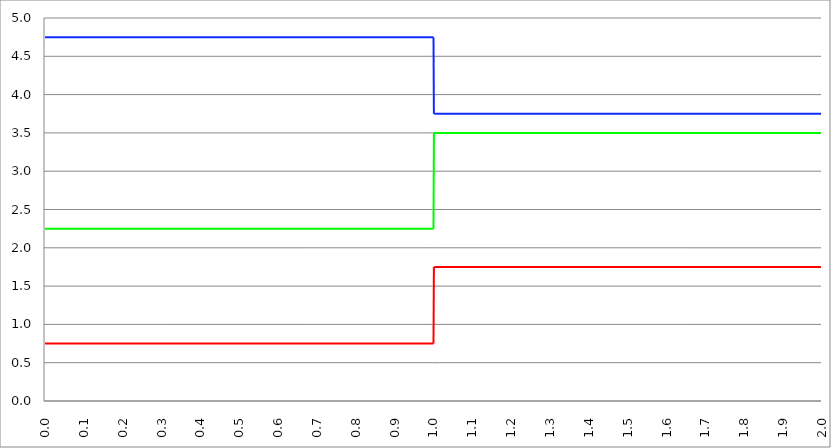
| Category | Series 1 | Series 0 | Series 2 |
|---|---|---|---|
| 0.0 | 0.75 | 2.25 | 4.75 |
| 0.001 | 0.75 | 2.25 | 4.75 |
| 0.002 | 0.75 | 2.25 | 4.75 |
| 0.003 | 0.75 | 2.25 | 4.75 |
| 0.004 | 0.75 | 2.25 | 4.75 |
| 0.005 | 0.75 | 2.25 | 4.75 |
| 0.006 | 0.75 | 2.25 | 4.75 |
| 0.007 | 0.75 | 2.25 | 4.75 |
| 0.008 | 0.75 | 2.25 | 4.75 |
| 0.009 | 0.75 | 2.25 | 4.75 |
| 0.01 | 0.75 | 2.25 | 4.75 |
| 0.011 | 0.75 | 2.25 | 4.75 |
| 0.012 | 0.75 | 2.25 | 4.75 |
| 0.013 | 0.75 | 2.25 | 4.75 |
| 0.014 | 0.75 | 2.25 | 4.75 |
| 0.015 | 0.75 | 2.25 | 4.75 |
| 0.016 | 0.75 | 2.25 | 4.75 |
| 0.017 | 0.75 | 2.25 | 4.75 |
| 0.018 | 0.75 | 2.25 | 4.75 |
| 0.019 | 0.75 | 2.25 | 4.75 |
| 0.02 | 0.75 | 2.25 | 4.75 |
| 0.021 | 0.75 | 2.25 | 4.75 |
| 0.022 | 0.75 | 2.25 | 4.75 |
| 0.023 | 0.75 | 2.25 | 4.75 |
| 0.024 | 0.75 | 2.25 | 4.75 |
| 0.025 | 0.75 | 2.25 | 4.75 |
| 0.026 | 0.75 | 2.25 | 4.75 |
| 0.027 | 0.75 | 2.25 | 4.75 |
| 0.028 | 0.75 | 2.25 | 4.75 |
| 0.029 | 0.75 | 2.25 | 4.75 |
| 0.03 | 0.75 | 2.25 | 4.75 |
| 0.031 | 0.75 | 2.25 | 4.75 |
| 0.032 | 0.75 | 2.25 | 4.75 |
| 0.033 | 0.75 | 2.25 | 4.75 |
| 0.034 | 0.75 | 2.25 | 4.75 |
| 0.035 | 0.75 | 2.25 | 4.75 |
| 0.036 | 0.75 | 2.25 | 4.75 |
| 0.037 | 0.75 | 2.25 | 4.75 |
| 0.038 | 0.75 | 2.25 | 4.75 |
| 0.039 | 0.75 | 2.25 | 4.75 |
| 0.04 | 0.75 | 2.25 | 4.75 |
| 0.041 | 0.75 | 2.25 | 4.75 |
| 0.042 | 0.75 | 2.25 | 4.75 |
| 0.043 | 0.75 | 2.25 | 4.75 |
| 0.044 | 0.75 | 2.25 | 4.75 |
| 0.045 | 0.75 | 2.25 | 4.75 |
| 0.046 | 0.75 | 2.25 | 4.75 |
| 0.047 | 0.75 | 2.25 | 4.75 |
| 0.048 | 0.75 | 2.25 | 4.75 |
| 0.049 | 0.75 | 2.25 | 4.75 |
| 0.05 | 0.75 | 2.25 | 4.75 |
| 0.051 | 0.75 | 2.25 | 4.75 |
| 0.052 | 0.75 | 2.25 | 4.75 |
| 0.053 | 0.75 | 2.25 | 4.75 |
| 0.054 | 0.75 | 2.25 | 4.75 |
| 0.055 | 0.75 | 2.25 | 4.75 |
| 0.056 | 0.75 | 2.25 | 4.75 |
| 0.057 | 0.75 | 2.25 | 4.75 |
| 0.058 | 0.75 | 2.25 | 4.75 |
| 0.059 | 0.75 | 2.25 | 4.75 |
| 0.06 | 0.75 | 2.25 | 4.75 |
| 0.061 | 0.75 | 2.25 | 4.75 |
| 0.062 | 0.75 | 2.25 | 4.75 |
| 0.063 | 0.75 | 2.25 | 4.75 |
| 0.064 | 0.75 | 2.25 | 4.75 |
| 0.065 | 0.75 | 2.25 | 4.75 |
| 0.066 | 0.75 | 2.25 | 4.75 |
| 0.067 | 0.75 | 2.25 | 4.75 |
| 0.068 | 0.75 | 2.25 | 4.75 |
| 0.069 | 0.75 | 2.25 | 4.75 |
| 0.07 | 0.75 | 2.25 | 4.75 |
| 0.071 | 0.75 | 2.25 | 4.75 |
| 0.072 | 0.75 | 2.25 | 4.75 |
| 0.073 | 0.75 | 2.25 | 4.75 |
| 0.074 | 0.75 | 2.25 | 4.75 |
| 0.075 | 0.75 | 2.25 | 4.75 |
| 0.076 | 0.75 | 2.25 | 4.75 |
| 0.077 | 0.75 | 2.25 | 4.75 |
| 0.078 | 0.75 | 2.25 | 4.75 |
| 0.079 | 0.75 | 2.25 | 4.75 |
| 0.08 | 0.75 | 2.25 | 4.75 |
| 0.081 | 0.75 | 2.25 | 4.75 |
| 0.082 | 0.75 | 2.25 | 4.75 |
| 0.083 | 0.75 | 2.25 | 4.75 |
| 0.084 | 0.75 | 2.25 | 4.75 |
| 0.085 | 0.75 | 2.25 | 4.75 |
| 0.086 | 0.75 | 2.25 | 4.75 |
| 0.087 | 0.75 | 2.25 | 4.75 |
| 0.088 | 0.75 | 2.25 | 4.75 |
| 0.089 | 0.75 | 2.25 | 4.75 |
| 0.09 | 0.75 | 2.25 | 4.75 |
| 0.091 | 0.75 | 2.25 | 4.75 |
| 0.092 | 0.75 | 2.25 | 4.75 |
| 0.093 | 0.75 | 2.25 | 4.75 |
| 0.094 | 0.75 | 2.25 | 4.75 |
| 0.095 | 0.75 | 2.25 | 4.75 |
| 0.096 | 0.75 | 2.25 | 4.75 |
| 0.097 | 0.75 | 2.25 | 4.75 |
| 0.098 | 0.75 | 2.25 | 4.75 |
| 0.099 | 0.75 | 2.25 | 4.75 |
| 0.1 | 0.75 | 2.25 | 4.75 |
| 0.101 | 0.75 | 2.25 | 4.75 |
| 0.102 | 0.75 | 2.25 | 4.75 |
| 0.103 | 0.75 | 2.25 | 4.75 |
| 0.104 | 0.75 | 2.25 | 4.75 |
| 0.105 | 0.75 | 2.25 | 4.75 |
| 0.106 | 0.75 | 2.25 | 4.75 |
| 0.107 | 0.75 | 2.25 | 4.75 |
| 0.108 | 0.75 | 2.25 | 4.75 |
| 0.109 | 0.75 | 2.25 | 4.75 |
| 0.11 | 0.75 | 2.25 | 4.75 |
| 0.111 | 0.75 | 2.25 | 4.75 |
| 0.112 | 0.75 | 2.25 | 4.75 |
| 0.113 | 0.75 | 2.25 | 4.75 |
| 0.114 | 0.75 | 2.25 | 4.75 |
| 0.115 | 0.75 | 2.25 | 4.75 |
| 0.116 | 0.75 | 2.25 | 4.75 |
| 0.117 | 0.75 | 2.25 | 4.75 |
| 0.118 | 0.75 | 2.25 | 4.75 |
| 0.119 | 0.75 | 2.25 | 4.75 |
| 0.12 | 0.75 | 2.25 | 4.75 |
| 0.121 | 0.75 | 2.25 | 4.75 |
| 0.122 | 0.75 | 2.25 | 4.75 |
| 0.123 | 0.75 | 2.25 | 4.75 |
| 0.124 | 0.75 | 2.25 | 4.75 |
| 0.125 | 0.75 | 2.25 | 4.75 |
| 0.126 | 0.75 | 2.25 | 4.75 |
| 0.127 | 0.75 | 2.25 | 4.75 |
| 0.128 | 0.75 | 2.25 | 4.75 |
| 0.129 | 0.75 | 2.25 | 4.75 |
| 0.13 | 0.75 | 2.25 | 4.75 |
| 0.131 | 0.75 | 2.25 | 4.75 |
| 0.132 | 0.75 | 2.25 | 4.75 |
| 0.133 | 0.75 | 2.25 | 4.75 |
| 0.134 | 0.75 | 2.25 | 4.75 |
| 0.135 | 0.75 | 2.25 | 4.75 |
| 0.136 | 0.75 | 2.25 | 4.75 |
| 0.137 | 0.75 | 2.25 | 4.75 |
| 0.138 | 0.75 | 2.25 | 4.75 |
| 0.139 | 0.75 | 2.25 | 4.75 |
| 0.14 | 0.75 | 2.25 | 4.75 |
| 0.141 | 0.75 | 2.25 | 4.75 |
| 0.142 | 0.75 | 2.25 | 4.75 |
| 0.143 | 0.75 | 2.25 | 4.75 |
| 0.144 | 0.75 | 2.25 | 4.75 |
| 0.145 | 0.75 | 2.25 | 4.75 |
| 0.146 | 0.75 | 2.25 | 4.75 |
| 0.147 | 0.75 | 2.25 | 4.75 |
| 0.148 | 0.75 | 2.25 | 4.75 |
| 0.149 | 0.75 | 2.25 | 4.75 |
| 0.15 | 0.75 | 2.25 | 4.75 |
| 0.151 | 0.75 | 2.25 | 4.75 |
| 0.152 | 0.75 | 2.25 | 4.75 |
| 0.153 | 0.75 | 2.25 | 4.75 |
| 0.154 | 0.75 | 2.25 | 4.75 |
| 0.155 | 0.75 | 2.25 | 4.75 |
| 0.156 | 0.75 | 2.25 | 4.75 |
| 0.157 | 0.75 | 2.25 | 4.75 |
| 0.158 | 0.75 | 2.25 | 4.75 |
| 0.159 | 0.75 | 2.25 | 4.75 |
| 0.16 | 0.75 | 2.25 | 4.75 |
| 0.161 | 0.75 | 2.25 | 4.75 |
| 0.162 | 0.75 | 2.25 | 4.75 |
| 0.163 | 0.75 | 2.25 | 4.75 |
| 0.164 | 0.75 | 2.25 | 4.75 |
| 0.165 | 0.75 | 2.25 | 4.75 |
| 0.166 | 0.75 | 2.25 | 4.75 |
| 0.167 | 0.75 | 2.25 | 4.75 |
| 0.168 | 0.75 | 2.25 | 4.75 |
| 0.169 | 0.75 | 2.25 | 4.75 |
| 0.17 | 0.75 | 2.25 | 4.75 |
| 0.171 | 0.75 | 2.25 | 4.75 |
| 0.172 | 0.75 | 2.25 | 4.75 |
| 0.173 | 0.75 | 2.25 | 4.75 |
| 0.174 | 0.75 | 2.25 | 4.75 |
| 0.175 | 0.75 | 2.25 | 4.75 |
| 0.176 | 0.75 | 2.25 | 4.75 |
| 0.177 | 0.75 | 2.25 | 4.75 |
| 0.178 | 0.75 | 2.25 | 4.75 |
| 0.179 | 0.75 | 2.25 | 4.75 |
| 0.18 | 0.75 | 2.25 | 4.75 |
| 0.181 | 0.75 | 2.25 | 4.75 |
| 0.182 | 0.75 | 2.25 | 4.75 |
| 0.183 | 0.75 | 2.25 | 4.75 |
| 0.184 | 0.75 | 2.25 | 4.75 |
| 0.185 | 0.75 | 2.25 | 4.75 |
| 0.186 | 0.75 | 2.25 | 4.75 |
| 0.187 | 0.75 | 2.25 | 4.75 |
| 0.188 | 0.75 | 2.25 | 4.75 |
| 0.189 | 0.75 | 2.25 | 4.75 |
| 0.19 | 0.75 | 2.25 | 4.75 |
| 0.191 | 0.75 | 2.25 | 4.75 |
| 0.192 | 0.75 | 2.25 | 4.75 |
| 0.193 | 0.75 | 2.25 | 4.75 |
| 0.194 | 0.75 | 2.25 | 4.75 |
| 0.195 | 0.75 | 2.25 | 4.75 |
| 0.196 | 0.75 | 2.25 | 4.75 |
| 0.197 | 0.75 | 2.25 | 4.75 |
| 0.198 | 0.75 | 2.25 | 4.75 |
| 0.199 | 0.75 | 2.25 | 4.75 |
| 0.2 | 0.75 | 2.25 | 4.75 |
| 0.201 | 0.75 | 2.25 | 4.75 |
| 0.202 | 0.75 | 2.25 | 4.75 |
| 0.203 | 0.75 | 2.25 | 4.75 |
| 0.204 | 0.75 | 2.25 | 4.75 |
| 0.205 | 0.75 | 2.25 | 4.75 |
| 0.206 | 0.75 | 2.25 | 4.75 |
| 0.207 | 0.75 | 2.25 | 4.75 |
| 0.208 | 0.75 | 2.25 | 4.75 |
| 0.209 | 0.75 | 2.25 | 4.75 |
| 0.21 | 0.75 | 2.25 | 4.75 |
| 0.211 | 0.75 | 2.25 | 4.75 |
| 0.212 | 0.75 | 2.25 | 4.75 |
| 0.213 | 0.75 | 2.25 | 4.75 |
| 0.214 | 0.75 | 2.25 | 4.75 |
| 0.215 | 0.75 | 2.25 | 4.75 |
| 0.216 | 0.75 | 2.25 | 4.75 |
| 0.217 | 0.75 | 2.25 | 4.75 |
| 0.218 | 0.75 | 2.25 | 4.75 |
| 0.219 | 0.75 | 2.25 | 4.75 |
| 0.22 | 0.75 | 2.25 | 4.75 |
| 0.221 | 0.75 | 2.25 | 4.75 |
| 0.222 | 0.75 | 2.25 | 4.75 |
| 0.223 | 0.75 | 2.25 | 4.75 |
| 0.224 | 0.75 | 2.25 | 4.75 |
| 0.225 | 0.75 | 2.25 | 4.75 |
| 0.226 | 0.75 | 2.25 | 4.75 |
| 0.227 | 0.75 | 2.25 | 4.75 |
| 0.228 | 0.75 | 2.25 | 4.75 |
| 0.229 | 0.75 | 2.25 | 4.75 |
| 0.23 | 0.75 | 2.25 | 4.75 |
| 0.231 | 0.75 | 2.25 | 4.75 |
| 0.232 | 0.75 | 2.25 | 4.75 |
| 0.233 | 0.75 | 2.25 | 4.75 |
| 0.234 | 0.75 | 2.25 | 4.75 |
| 0.235 | 0.75 | 2.25 | 4.75 |
| 0.236 | 0.75 | 2.25 | 4.75 |
| 0.237 | 0.75 | 2.25 | 4.75 |
| 0.238 | 0.75 | 2.25 | 4.75 |
| 0.239 | 0.75 | 2.25 | 4.75 |
| 0.24 | 0.75 | 2.25 | 4.75 |
| 0.241 | 0.75 | 2.25 | 4.75 |
| 0.242 | 0.75 | 2.25 | 4.75 |
| 0.243 | 0.75 | 2.25 | 4.75 |
| 0.244 | 0.75 | 2.25 | 4.75 |
| 0.245 | 0.75 | 2.25 | 4.75 |
| 0.246 | 0.75 | 2.25 | 4.75 |
| 0.247 | 0.75 | 2.25 | 4.75 |
| 0.248 | 0.75 | 2.25 | 4.75 |
| 0.249 | 0.75 | 2.25 | 4.75 |
| 0.25 | 0.75 | 2.25 | 4.75 |
| 0.251 | 0.75 | 2.25 | 4.75 |
| 0.252 | 0.75 | 2.25 | 4.75 |
| 0.253 | 0.75 | 2.25 | 4.75 |
| 0.254 | 0.75 | 2.25 | 4.75 |
| 0.255 | 0.75 | 2.25 | 4.75 |
| 0.256 | 0.75 | 2.25 | 4.75 |
| 0.257 | 0.75 | 2.25 | 4.75 |
| 0.258 | 0.75 | 2.25 | 4.75 |
| 0.259 | 0.75 | 2.25 | 4.75 |
| 0.26 | 0.75 | 2.25 | 4.75 |
| 0.261 | 0.75 | 2.25 | 4.75 |
| 0.262 | 0.75 | 2.25 | 4.75 |
| 0.263 | 0.75 | 2.25 | 4.75 |
| 0.264 | 0.75 | 2.25 | 4.75 |
| 0.265 | 0.75 | 2.25 | 4.75 |
| 0.266 | 0.75 | 2.25 | 4.75 |
| 0.267 | 0.75 | 2.25 | 4.75 |
| 0.268 | 0.75 | 2.25 | 4.75 |
| 0.269 | 0.75 | 2.25 | 4.75 |
| 0.27 | 0.75 | 2.25 | 4.75 |
| 0.271 | 0.75 | 2.25 | 4.75 |
| 0.272 | 0.75 | 2.25 | 4.75 |
| 0.273 | 0.75 | 2.25 | 4.75 |
| 0.274 | 0.75 | 2.25 | 4.75 |
| 0.275 | 0.75 | 2.25 | 4.75 |
| 0.276 | 0.75 | 2.25 | 4.75 |
| 0.277 | 0.75 | 2.25 | 4.75 |
| 0.278 | 0.75 | 2.25 | 4.75 |
| 0.279 | 0.75 | 2.25 | 4.75 |
| 0.28 | 0.75 | 2.25 | 4.75 |
| 0.281 | 0.75 | 2.25 | 4.75 |
| 0.282 | 0.75 | 2.25 | 4.75 |
| 0.283 | 0.75 | 2.25 | 4.75 |
| 0.284 | 0.75 | 2.25 | 4.75 |
| 0.285 | 0.75 | 2.25 | 4.75 |
| 0.286 | 0.75 | 2.25 | 4.75 |
| 0.287 | 0.75 | 2.25 | 4.75 |
| 0.288 | 0.75 | 2.25 | 4.75 |
| 0.289 | 0.75 | 2.25 | 4.75 |
| 0.29 | 0.75 | 2.25 | 4.75 |
| 0.291 | 0.75 | 2.25 | 4.75 |
| 0.292 | 0.75 | 2.25 | 4.75 |
| 0.293 | 0.75 | 2.25 | 4.75 |
| 0.294 | 0.75 | 2.25 | 4.75 |
| 0.295 | 0.75 | 2.25 | 4.75 |
| 0.296 | 0.75 | 2.25 | 4.75 |
| 0.297 | 0.75 | 2.25 | 4.75 |
| 0.298 | 0.75 | 2.25 | 4.75 |
| 0.299 | 0.75 | 2.25 | 4.75 |
| 0.3 | 0.75 | 2.25 | 4.75 |
| 0.301 | 0.75 | 2.25 | 4.75 |
| 0.302 | 0.75 | 2.25 | 4.75 |
| 0.303 | 0.75 | 2.25 | 4.75 |
| 0.304 | 0.75 | 2.25 | 4.75 |
| 0.305 | 0.75 | 2.25 | 4.75 |
| 0.306 | 0.75 | 2.25 | 4.75 |
| 0.307 | 0.75 | 2.25 | 4.75 |
| 0.308 | 0.75 | 2.25 | 4.75 |
| 0.309 | 0.75 | 2.25 | 4.75 |
| 0.31 | 0.75 | 2.25 | 4.75 |
| 0.311 | 0.75 | 2.25 | 4.75 |
| 0.312 | 0.75 | 2.25 | 4.75 |
| 0.313 | 0.75 | 2.25 | 4.75 |
| 0.314 | 0.75 | 2.25 | 4.75 |
| 0.315 | 0.75 | 2.25 | 4.75 |
| 0.316 | 0.75 | 2.25 | 4.75 |
| 0.317 | 0.75 | 2.25 | 4.75 |
| 0.318 | 0.75 | 2.25 | 4.75 |
| 0.319 | 0.75 | 2.25 | 4.75 |
| 0.32 | 0.75 | 2.25 | 4.75 |
| 0.321 | 0.75 | 2.25 | 4.75 |
| 0.322 | 0.75 | 2.25 | 4.75 |
| 0.323 | 0.75 | 2.25 | 4.75 |
| 0.324 | 0.75 | 2.25 | 4.75 |
| 0.325 | 0.75 | 2.25 | 4.75 |
| 0.326 | 0.75 | 2.25 | 4.75 |
| 0.327 | 0.75 | 2.25 | 4.75 |
| 0.328 | 0.75 | 2.25 | 4.75 |
| 0.329 | 0.75 | 2.25 | 4.75 |
| 0.33 | 0.75 | 2.25 | 4.75 |
| 0.331 | 0.75 | 2.25 | 4.75 |
| 0.332 | 0.75 | 2.25 | 4.75 |
| 0.333 | 0.75 | 2.25 | 4.75 |
| 0.334 | 0.75 | 2.25 | 4.75 |
| 0.335 | 0.75 | 2.25 | 4.75 |
| 0.336 | 0.75 | 2.25 | 4.75 |
| 0.337 | 0.75 | 2.25 | 4.75 |
| 0.338 | 0.75 | 2.25 | 4.75 |
| 0.339 | 0.75 | 2.25 | 4.75 |
| 0.34 | 0.75 | 2.25 | 4.75 |
| 0.341 | 0.75 | 2.25 | 4.75 |
| 0.342 | 0.75 | 2.25 | 4.75 |
| 0.343 | 0.75 | 2.25 | 4.75 |
| 0.344 | 0.75 | 2.25 | 4.75 |
| 0.345 | 0.75 | 2.25 | 4.75 |
| 0.346 | 0.75 | 2.25 | 4.75 |
| 0.347 | 0.75 | 2.25 | 4.75 |
| 0.348 | 0.75 | 2.25 | 4.75 |
| 0.349 | 0.75 | 2.25 | 4.75 |
| 0.35 | 0.75 | 2.25 | 4.75 |
| 0.351 | 0.75 | 2.25 | 4.75 |
| 0.352 | 0.75 | 2.25 | 4.75 |
| 0.353 | 0.75 | 2.25 | 4.75 |
| 0.354 | 0.75 | 2.25 | 4.75 |
| 0.355 | 0.75 | 2.25 | 4.75 |
| 0.356 | 0.75 | 2.25 | 4.75 |
| 0.357 | 0.75 | 2.25 | 4.75 |
| 0.358 | 0.75 | 2.25 | 4.75 |
| 0.359 | 0.75 | 2.25 | 4.75 |
| 0.36 | 0.75 | 2.25 | 4.75 |
| 0.361 | 0.75 | 2.25 | 4.75 |
| 0.362 | 0.75 | 2.25 | 4.75 |
| 0.363 | 0.75 | 2.25 | 4.75 |
| 0.364 | 0.75 | 2.25 | 4.75 |
| 0.365 | 0.75 | 2.25 | 4.75 |
| 0.366 | 0.75 | 2.25 | 4.75 |
| 0.367 | 0.75 | 2.25 | 4.75 |
| 0.368 | 0.75 | 2.25 | 4.75 |
| 0.369 | 0.75 | 2.25 | 4.75 |
| 0.37 | 0.75 | 2.25 | 4.75 |
| 0.371 | 0.75 | 2.25 | 4.75 |
| 0.372 | 0.75 | 2.25 | 4.75 |
| 0.373 | 0.75 | 2.25 | 4.75 |
| 0.374 | 0.75 | 2.25 | 4.75 |
| 0.375 | 0.75 | 2.25 | 4.75 |
| 0.376 | 0.75 | 2.25 | 4.75 |
| 0.377 | 0.75 | 2.25 | 4.75 |
| 0.378 | 0.75 | 2.25 | 4.75 |
| 0.379 | 0.75 | 2.25 | 4.75 |
| 0.38 | 0.75 | 2.25 | 4.75 |
| 0.381 | 0.75 | 2.25 | 4.75 |
| 0.382 | 0.75 | 2.25 | 4.75 |
| 0.383 | 0.75 | 2.25 | 4.75 |
| 0.384 | 0.75 | 2.25 | 4.75 |
| 0.385 | 0.75 | 2.25 | 4.75 |
| 0.386 | 0.75 | 2.25 | 4.75 |
| 0.387 | 0.75 | 2.25 | 4.75 |
| 0.388 | 0.75 | 2.25 | 4.75 |
| 0.389 | 0.75 | 2.25 | 4.75 |
| 0.39 | 0.75 | 2.25 | 4.75 |
| 0.391 | 0.75 | 2.25 | 4.75 |
| 0.392 | 0.75 | 2.25 | 4.75 |
| 0.393 | 0.75 | 2.25 | 4.75 |
| 0.394 | 0.75 | 2.25 | 4.75 |
| 0.395 | 0.75 | 2.25 | 4.75 |
| 0.396 | 0.75 | 2.25 | 4.75 |
| 0.397 | 0.75 | 2.25 | 4.75 |
| 0.398 | 0.75 | 2.25 | 4.75 |
| 0.399 | 0.75 | 2.25 | 4.75 |
| 0.4 | 0.75 | 2.25 | 4.75 |
| 0.401 | 0.75 | 2.25 | 4.75 |
| 0.402 | 0.75 | 2.25 | 4.75 |
| 0.403 | 0.75 | 2.25 | 4.75 |
| 0.404 | 0.75 | 2.25 | 4.75 |
| 0.405 | 0.75 | 2.25 | 4.75 |
| 0.406 | 0.75 | 2.25 | 4.75 |
| 0.407 | 0.75 | 2.25 | 4.75 |
| 0.408 | 0.75 | 2.25 | 4.75 |
| 0.409 | 0.75 | 2.25 | 4.75 |
| 0.41 | 0.75 | 2.25 | 4.75 |
| 0.411 | 0.75 | 2.25 | 4.75 |
| 0.412 | 0.75 | 2.25 | 4.75 |
| 0.413 | 0.75 | 2.25 | 4.75 |
| 0.414 | 0.75 | 2.25 | 4.75 |
| 0.415 | 0.75 | 2.25 | 4.75 |
| 0.416 | 0.75 | 2.25 | 4.75 |
| 0.417 | 0.75 | 2.25 | 4.75 |
| 0.418 | 0.75 | 2.25 | 4.75 |
| 0.419 | 0.75 | 2.25 | 4.75 |
| 0.42 | 0.75 | 2.25 | 4.75 |
| 0.421 | 0.75 | 2.25 | 4.75 |
| 0.422 | 0.75 | 2.25 | 4.75 |
| 0.423 | 0.75 | 2.25 | 4.75 |
| 0.424 | 0.75 | 2.25 | 4.75 |
| 0.425 | 0.75 | 2.25 | 4.75 |
| 0.426 | 0.75 | 2.25 | 4.75 |
| 0.427 | 0.75 | 2.25 | 4.75 |
| 0.428 | 0.75 | 2.25 | 4.75 |
| 0.429 | 0.75 | 2.25 | 4.75 |
| 0.43 | 0.75 | 2.25 | 4.75 |
| 0.431 | 0.75 | 2.25 | 4.75 |
| 0.432 | 0.75 | 2.25 | 4.75 |
| 0.433 | 0.75 | 2.25 | 4.75 |
| 0.434 | 0.75 | 2.25 | 4.75 |
| 0.435 | 0.75 | 2.25 | 4.75 |
| 0.436 | 0.75 | 2.25 | 4.75 |
| 0.437 | 0.75 | 2.25 | 4.75 |
| 0.438 | 0.75 | 2.25 | 4.75 |
| 0.439 | 0.75 | 2.25 | 4.75 |
| 0.44 | 0.75 | 2.25 | 4.75 |
| 0.441 | 0.75 | 2.25 | 4.75 |
| 0.442 | 0.75 | 2.25 | 4.75 |
| 0.443 | 0.75 | 2.25 | 4.75 |
| 0.444 | 0.75 | 2.25 | 4.75 |
| 0.445 | 0.75 | 2.25 | 4.75 |
| 0.446 | 0.75 | 2.25 | 4.75 |
| 0.447 | 0.75 | 2.25 | 4.75 |
| 0.448 | 0.75 | 2.25 | 4.75 |
| 0.449 | 0.75 | 2.25 | 4.75 |
| 0.45 | 0.75 | 2.25 | 4.75 |
| 0.451 | 0.75 | 2.25 | 4.75 |
| 0.452 | 0.75 | 2.25 | 4.75 |
| 0.453 | 0.75 | 2.25 | 4.75 |
| 0.454 | 0.75 | 2.25 | 4.75 |
| 0.455 | 0.75 | 2.25 | 4.75 |
| 0.456 | 0.75 | 2.25 | 4.75 |
| 0.457 | 0.75 | 2.25 | 4.75 |
| 0.458 | 0.75 | 2.25 | 4.75 |
| 0.459 | 0.75 | 2.25 | 4.75 |
| 0.46 | 0.75 | 2.25 | 4.75 |
| 0.461 | 0.75 | 2.25 | 4.75 |
| 0.462 | 0.75 | 2.25 | 4.75 |
| 0.463 | 0.75 | 2.25 | 4.75 |
| 0.464 | 0.75 | 2.25 | 4.75 |
| 0.465 | 0.75 | 2.25 | 4.75 |
| 0.466 | 0.75 | 2.25 | 4.75 |
| 0.467 | 0.75 | 2.25 | 4.75 |
| 0.468 | 0.75 | 2.25 | 4.75 |
| 0.469 | 0.75 | 2.25 | 4.75 |
| 0.47 | 0.75 | 2.25 | 4.75 |
| 0.471 | 0.75 | 2.25 | 4.75 |
| 0.472 | 0.75 | 2.25 | 4.75 |
| 0.473 | 0.75 | 2.25 | 4.75 |
| 0.474 | 0.75 | 2.25 | 4.75 |
| 0.475 | 0.75 | 2.25 | 4.75 |
| 0.476 | 0.75 | 2.25 | 4.75 |
| 0.477 | 0.75 | 2.25 | 4.75 |
| 0.478 | 0.75 | 2.25 | 4.75 |
| 0.479 | 0.75 | 2.25 | 4.75 |
| 0.48 | 0.75 | 2.25 | 4.75 |
| 0.481 | 0.75 | 2.25 | 4.75 |
| 0.482 | 0.75 | 2.25 | 4.75 |
| 0.483 | 0.75 | 2.25 | 4.75 |
| 0.484 | 0.75 | 2.25 | 4.75 |
| 0.485 | 0.75 | 2.25 | 4.75 |
| 0.486 | 0.75 | 2.25 | 4.75 |
| 0.487 | 0.75 | 2.25 | 4.75 |
| 0.488 | 0.75 | 2.25 | 4.75 |
| 0.489 | 0.75 | 2.25 | 4.75 |
| 0.49 | 0.75 | 2.25 | 4.75 |
| 0.491 | 0.75 | 2.25 | 4.75 |
| 0.492 | 0.75 | 2.25 | 4.75 |
| 0.493 | 0.75 | 2.25 | 4.75 |
| 0.494 | 0.75 | 2.25 | 4.75 |
| 0.495 | 0.75 | 2.25 | 4.75 |
| 0.496 | 0.75 | 2.25 | 4.75 |
| 0.497 | 0.75 | 2.25 | 4.75 |
| 0.498 | 0.75 | 2.25 | 4.75 |
| 0.499 | 0.75 | 2.25 | 4.75 |
| 0.5 | 0.75 | 2.25 | 4.75 |
| 0.501 | 0.75 | 2.25 | 4.75 |
| 0.502 | 0.75 | 2.25 | 4.75 |
| 0.503 | 0.75 | 2.25 | 4.75 |
| 0.504 | 0.75 | 2.25 | 4.75 |
| 0.505 | 0.75 | 2.25 | 4.75 |
| 0.506 | 0.75 | 2.25 | 4.75 |
| 0.507 | 0.75 | 2.25 | 4.75 |
| 0.508 | 0.75 | 2.25 | 4.75 |
| 0.509 | 0.75 | 2.25 | 4.75 |
| 0.51 | 0.75 | 2.25 | 4.75 |
| 0.511 | 0.75 | 2.25 | 4.75 |
| 0.512 | 0.75 | 2.25 | 4.75 |
| 0.513 | 0.75 | 2.25 | 4.75 |
| 0.514 | 0.75 | 2.25 | 4.75 |
| 0.515 | 0.75 | 2.25 | 4.75 |
| 0.516 | 0.75 | 2.25 | 4.75 |
| 0.517 | 0.75 | 2.25 | 4.75 |
| 0.518 | 0.75 | 2.25 | 4.75 |
| 0.519 | 0.75 | 2.25 | 4.75 |
| 0.52 | 0.75 | 2.25 | 4.75 |
| 0.521 | 0.75 | 2.25 | 4.75 |
| 0.522 | 0.75 | 2.25 | 4.75 |
| 0.523 | 0.75 | 2.25 | 4.75 |
| 0.524 | 0.75 | 2.25 | 4.75 |
| 0.525 | 0.75 | 2.25 | 4.75 |
| 0.526 | 0.75 | 2.25 | 4.75 |
| 0.527 | 0.75 | 2.25 | 4.75 |
| 0.528 | 0.75 | 2.25 | 4.75 |
| 0.529 | 0.75 | 2.25 | 4.75 |
| 0.53 | 0.75 | 2.25 | 4.75 |
| 0.531 | 0.75 | 2.25 | 4.75 |
| 0.532 | 0.75 | 2.25 | 4.75 |
| 0.533 | 0.75 | 2.25 | 4.75 |
| 0.534 | 0.75 | 2.25 | 4.75 |
| 0.535 | 0.75 | 2.25 | 4.75 |
| 0.536 | 0.75 | 2.25 | 4.75 |
| 0.537 | 0.75 | 2.25 | 4.75 |
| 0.538 | 0.75 | 2.25 | 4.75 |
| 0.539 | 0.75 | 2.25 | 4.75 |
| 0.54 | 0.75 | 2.25 | 4.75 |
| 0.541 | 0.75 | 2.25 | 4.75 |
| 0.542 | 0.75 | 2.25 | 4.75 |
| 0.543 | 0.75 | 2.25 | 4.75 |
| 0.544 | 0.75 | 2.25 | 4.75 |
| 0.545 | 0.75 | 2.25 | 4.75 |
| 0.546 | 0.75 | 2.25 | 4.75 |
| 0.547 | 0.75 | 2.25 | 4.75 |
| 0.548 | 0.75 | 2.25 | 4.75 |
| 0.549 | 0.75 | 2.25 | 4.75 |
| 0.55 | 0.75 | 2.25 | 4.75 |
| 0.551 | 0.75 | 2.25 | 4.75 |
| 0.552 | 0.75 | 2.25 | 4.75 |
| 0.553 | 0.75 | 2.25 | 4.75 |
| 0.554 | 0.75 | 2.25 | 4.75 |
| 0.555 | 0.75 | 2.25 | 4.75 |
| 0.556 | 0.75 | 2.25 | 4.75 |
| 0.557 | 0.75 | 2.25 | 4.75 |
| 0.558 | 0.75 | 2.25 | 4.75 |
| 0.559 | 0.75 | 2.25 | 4.75 |
| 0.56 | 0.75 | 2.25 | 4.75 |
| 0.561 | 0.75 | 2.25 | 4.75 |
| 0.562 | 0.75 | 2.25 | 4.75 |
| 0.563 | 0.75 | 2.25 | 4.75 |
| 0.564 | 0.75 | 2.25 | 4.75 |
| 0.565 | 0.75 | 2.25 | 4.75 |
| 0.566 | 0.75 | 2.25 | 4.75 |
| 0.567 | 0.75 | 2.25 | 4.75 |
| 0.568 | 0.75 | 2.25 | 4.75 |
| 0.569 | 0.75 | 2.25 | 4.75 |
| 0.57 | 0.75 | 2.25 | 4.75 |
| 0.571 | 0.75 | 2.25 | 4.75 |
| 0.572 | 0.75 | 2.25 | 4.75 |
| 0.573 | 0.75 | 2.25 | 4.75 |
| 0.574 | 0.75 | 2.25 | 4.75 |
| 0.575 | 0.75 | 2.25 | 4.75 |
| 0.576 | 0.75 | 2.25 | 4.75 |
| 0.577 | 0.75 | 2.25 | 4.75 |
| 0.578 | 0.75 | 2.25 | 4.75 |
| 0.579 | 0.75 | 2.25 | 4.75 |
| 0.58 | 0.75 | 2.25 | 4.75 |
| 0.581 | 0.75 | 2.25 | 4.75 |
| 0.582 | 0.75 | 2.25 | 4.75 |
| 0.583 | 0.75 | 2.25 | 4.75 |
| 0.584 | 0.75 | 2.25 | 4.75 |
| 0.585 | 0.75 | 2.25 | 4.75 |
| 0.586 | 0.75 | 2.25 | 4.75 |
| 0.587 | 0.75 | 2.25 | 4.75 |
| 0.588 | 0.75 | 2.25 | 4.75 |
| 0.589 | 0.75 | 2.25 | 4.75 |
| 0.59 | 0.75 | 2.25 | 4.75 |
| 0.591 | 0.75 | 2.25 | 4.75 |
| 0.592 | 0.75 | 2.25 | 4.75 |
| 0.593 | 0.75 | 2.25 | 4.75 |
| 0.594 | 0.75 | 2.25 | 4.75 |
| 0.595 | 0.75 | 2.25 | 4.75 |
| 0.596 | 0.75 | 2.25 | 4.75 |
| 0.597 | 0.75 | 2.25 | 4.75 |
| 0.598 | 0.75 | 2.25 | 4.75 |
| 0.599 | 0.75 | 2.25 | 4.75 |
| 0.6 | 0.75 | 2.25 | 4.75 |
| 0.601 | 0.75 | 2.25 | 4.75 |
| 0.602 | 0.75 | 2.25 | 4.75 |
| 0.603 | 0.75 | 2.25 | 4.75 |
| 0.604 | 0.75 | 2.25 | 4.75 |
| 0.605 | 0.75 | 2.25 | 4.75 |
| 0.606 | 0.75 | 2.25 | 4.75 |
| 0.607 | 0.75 | 2.25 | 4.75 |
| 0.608 | 0.75 | 2.25 | 4.75 |
| 0.609 | 0.75 | 2.25 | 4.75 |
| 0.61 | 0.75 | 2.25 | 4.75 |
| 0.611 | 0.75 | 2.25 | 4.75 |
| 0.612 | 0.75 | 2.25 | 4.75 |
| 0.613 | 0.75 | 2.25 | 4.75 |
| 0.614 | 0.75 | 2.25 | 4.75 |
| 0.615 | 0.75 | 2.25 | 4.75 |
| 0.616 | 0.75 | 2.25 | 4.75 |
| 0.617 | 0.75 | 2.25 | 4.75 |
| 0.618 | 0.75 | 2.25 | 4.75 |
| 0.619 | 0.75 | 2.25 | 4.75 |
| 0.62 | 0.75 | 2.25 | 4.75 |
| 0.621 | 0.75 | 2.25 | 4.75 |
| 0.622 | 0.75 | 2.25 | 4.75 |
| 0.623 | 0.75 | 2.25 | 4.75 |
| 0.624 | 0.75 | 2.25 | 4.75 |
| 0.625 | 0.75 | 2.25 | 4.75 |
| 0.626 | 0.75 | 2.25 | 4.75 |
| 0.627 | 0.75 | 2.25 | 4.75 |
| 0.628 | 0.75 | 2.25 | 4.75 |
| 0.629 | 0.75 | 2.25 | 4.75 |
| 0.63 | 0.75 | 2.25 | 4.75 |
| 0.631 | 0.75 | 2.25 | 4.75 |
| 0.632 | 0.75 | 2.25 | 4.75 |
| 0.633 | 0.75 | 2.25 | 4.75 |
| 0.634 | 0.75 | 2.25 | 4.75 |
| 0.635 | 0.75 | 2.25 | 4.75 |
| 0.636 | 0.75 | 2.25 | 4.75 |
| 0.637 | 0.75 | 2.25 | 4.75 |
| 0.638 | 0.75 | 2.25 | 4.75 |
| 0.639 | 0.75 | 2.25 | 4.75 |
| 0.64 | 0.75 | 2.25 | 4.75 |
| 0.641 | 0.75 | 2.25 | 4.75 |
| 0.642 | 0.75 | 2.25 | 4.75 |
| 0.643 | 0.75 | 2.25 | 4.75 |
| 0.644 | 0.75 | 2.25 | 4.75 |
| 0.645 | 0.75 | 2.25 | 4.75 |
| 0.646 | 0.75 | 2.25 | 4.75 |
| 0.647 | 0.75 | 2.25 | 4.75 |
| 0.648 | 0.75 | 2.25 | 4.75 |
| 0.649 | 0.75 | 2.25 | 4.75 |
| 0.65 | 0.75 | 2.25 | 4.75 |
| 0.651 | 0.75 | 2.25 | 4.75 |
| 0.652 | 0.75 | 2.25 | 4.75 |
| 0.653 | 0.75 | 2.25 | 4.75 |
| 0.654 | 0.75 | 2.25 | 4.75 |
| 0.655 | 0.75 | 2.25 | 4.75 |
| 0.656 | 0.75 | 2.25 | 4.75 |
| 0.657 | 0.75 | 2.25 | 4.75 |
| 0.658 | 0.75 | 2.25 | 4.75 |
| 0.659 | 0.75 | 2.25 | 4.75 |
| 0.66 | 0.75 | 2.25 | 4.75 |
| 0.661 | 0.75 | 2.25 | 4.75 |
| 0.662 | 0.75 | 2.25 | 4.75 |
| 0.663 | 0.75 | 2.25 | 4.75 |
| 0.664 | 0.75 | 2.25 | 4.75 |
| 0.665 | 0.75 | 2.25 | 4.75 |
| 0.666 | 0.75 | 2.25 | 4.75 |
| 0.667 | 0.75 | 2.25 | 4.75 |
| 0.668 | 0.75 | 2.25 | 4.75 |
| 0.669 | 0.75 | 2.25 | 4.75 |
| 0.67 | 0.75 | 2.25 | 4.75 |
| 0.671 | 0.75 | 2.25 | 4.75 |
| 0.672 | 0.75 | 2.25 | 4.75 |
| 0.673 | 0.75 | 2.25 | 4.75 |
| 0.674 | 0.75 | 2.25 | 4.75 |
| 0.675 | 0.75 | 2.25 | 4.75 |
| 0.676 | 0.75 | 2.25 | 4.75 |
| 0.677 | 0.75 | 2.25 | 4.75 |
| 0.678 | 0.75 | 2.25 | 4.75 |
| 0.679 | 0.75 | 2.25 | 4.75 |
| 0.68 | 0.75 | 2.25 | 4.75 |
| 0.681 | 0.75 | 2.25 | 4.75 |
| 0.682 | 0.75 | 2.25 | 4.75 |
| 0.683 | 0.75 | 2.25 | 4.75 |
| 0.684 | 0.75 | 2.25 | 4.75 |
| 0.685 | 0.75 | 2.25 | 4.75 |
| 0.686 | 0.75 | 2.25 | 4.75 |
| 0.687 | 0.75 | 2.25 | 4.75 |
| 0.688 | 0.75 | 2.25 | 4.75 |
| 0.689 | 0.75 | 2.25 | 4.75 |
| 0.69 | 0.75 | 2.25 | 4.75 |
| 0.691 | 0.75 | 2.25 | 4.75 |
| 0.692 | 0.75 | 2.25 | 4.75 |
| 0.693 | 0.75 | 2.25 | 4.75 |
| 0.694 | 0.75 | 2.25 | 4.75 |
| 0.695 | 0.75 | 2.25 | 4.75 |
| 0.696 | 0.75 | 2.25 | 4.75 |
| 0.697 | 0.75 | 2.25 | 4.75 |
| 0.698 | 0.75 | 2.25 | 4.75 |
| 0.699 | 0.75 | 2.25 | 4.75 |
| 0.7 | 0.75 | 2.25 | 4.75 |
| 0.701 | 0.75 | 2.25 | 4.75 |
| 0.702 | 0.75 | 2.25 | 4.75 |
| 0.703 | 0.75 | 2.25 | 4.75 |
| 0.704 | 0.75 | 2.25 | 4.75 |
| 0.705 | 0.75 | 2.25 | 4.75 |
| 0.706 | 0.75 | 2.25 | 4.75 |
| 0.707 | 0.75 | 2.25 | 4.75 |
| 0.708 | 0.75 | 2.25 | 4.75 |
| 0.709 | 0.75 | 2.25 | 4.75 |
| 0.71 | 0.75 | 2.25 | 4.75 |
| 0.711 | 0.75 | 2.25 | 4.75 |
| 0.712 | 0.75 | 2.25 | 4.75 |
| 0.713 | 0.75 | 2.25 | 4.75 |
| 0.714 | 0.75 | 2.25 | 4.75 |
| 0.715 | 0.75 | 2.25 | 4.75 |
| 0.716 | 0.75 | 2.25 | 4.75 |
| 0.717 | 0.75 | 2.25 | 4.75 |
| 0.718 | 0.75 | 2.25 | 4.75 |
| 0.719 | 0.75 | 2.25 | 4.75 |
| 0.72 | 0.75 | 2.25 | 4.75 |
| 0.721 | 0.75 | 2.25 | 4.75 |
| 0.722 | 0.75 | 2.25 | 4.75 |
| 0.723 | 0.75 | 2.25 | 4.75 |
| 0.724 | 0.75 | 2.25 | 4.75 |
| 0.725 | 0.75 | 2.25 | 4.75 |
| 0.726 | 0.75 | 2.25 | 4.75 |
| 0.727 | 0.75 | 2.25 | 4.75 |
| 0.728 | 0.75 | 2.25 | 4.75 |
| 0.729 | 0.75 | 2.25 | 4.75 |
| 0.73 | 0.75 | 2.25 | 4.75 |
| 0.731 | 0.75 | 2.25 | 4.75 |
| 0.732 | 0.75 | 2.25 | 4.75 |
| 0.733 | 0.75 | 2.25 | 4.75 |
| 0.734 | 0.75 | 2.25 | 4.75 |
| 0.735 | 0.75 | 2.25 | 4.75 |
| 0.736 | 0.75 | 2.25 | 4.75 |
| 0.737 | 0.75 | 2.25 | 4.75 |
| 0.738 | 0.75 | 2.25 | 4.75 |
| 0.739 | 0.75 | 2.25 | 4.75 |
| 0.74 | 0.75 | 2.25 | 4.75 |
| 0.741 | 0.75 | 2.25 | 4.75 |
| 0.742 | 0.75 | 2.25 | 4.75 |
| 0.743 | 0.75 | 2.25 | 4.75 |
| 0.744 | 0.75 | 2.25 | 4.75 |
| 0.745 | 0.75 | 2.25 | 4.75 |
| 0.746 | 0.75 | 2.25 | 4.75 |
| 0.747 | 0.75 | 2.25 | 4.75 |
| 0.748 | 0.75 | 2.25 | 4.75 |
| 0.749 | 0.75 | 2.25 | 4.75 |
| 0.75 | 0.75 | 2.25 | 4.75 |
| 0.751 | 0.75 | 2.25 | 4.75 |
| 0.752 | 0.75 | 2.25 | 4.75 |
| 0.753 | 0.75 | 2.25 | 4.75 |
| 0.754 | 0.75 | 2.25 | 4.75 |
| 0.755 | 0.75 | 2.25 | 4.75 |
| 0.756 | 0.75 | 2.25 | 4.75 |
| 0.757 | 0.75 | 2.25 | 4.75 |
| 0.758 | 0.75 | 2.25 | 4.75 |
| 0.759 | 0.75 | 2.25 | 4.75 |
| 0.76 | 0.75 | 2.25 | 4.75 |
| 0.761 | 0.75 | 2.25 | 4.75 |
| 0.762 | 0.75 | 2.25 | 4.75 |
| 0.763 | 0.75 | 2.25 | 4.75 |
| 0.764 | 0.75 | 2.25 | 4.75 |
| 0.765 | 0.75 | 2.25 | 4.75 |
| 0.766 | 0.75 | 2.25 | 4.75 |
| 0.767 | 0.75 | 2.25 | 4.75 |
| 0.768 | 0.75 | 2.25 | 4.75 |
| 0.769 | 0.75 | 2.25 | 4.75 |
| 0.77 | 0.75 | 2.25 | 4.75 |
| 0.771000000000001 | 0.75 | 2.25 | 4.75 |
| 0.772000000000001 | 0.75 | 2.25 | 4.75 |
| 0.773000000000001 | 0.75 | 2.25 | 4.75 |
| 0.774000000000001 | 0.75 | 2.25 | 4.75 |
| 0.775000000000001 | 0.75 | 2.25 | 4.75 |
| 0.776000000000001 | 0.75 | 2.25 | 4.75 |
| 0.777000000000001 | 0.75 | 2.25 | 4.75 |
| 0.778000000000001 | 0.75 | 2.25 | 4.75 |
| 0.779000000000001 | 0.75 | 2.25 | 4.75 |
| 0.78 | 0.75 | 2.25 | 4.75 |
| 0.781000000000001 | 0.75 | 2.25 | 4.75 |
| 0.782000000000001 | 0.75 | 2.25 | 4.75 |
| 0.783000000000001 | 0.75 | 2.25 | 4.75 |
| 0.784000000000001 | 0.75 | 2.25 | 4.75 |
| 0.785000000000001 | 0.75 | 2.25 | 4.75 |
| 0.786000000000001 | 0.75 | 2.25 | 4.75 |
| 0.787000000000001 | 0.75 | 2.25 | 4.75 |
| 0.788000000000001 | 0.75 | 2.25 | 4.75 |
| 0.789000000000001 | 0.75 | 2.25 | 4.75 |
| 0.79 | 0.75 | 2.25 | 4.75 |
| 0.791000000000001 | 0.75 | 2.25 | 4.75 |
| 0.792000000000001 | 0.75 | 2.25 | 4.75 |
| 0.793000000000001 | 0.75 | 2.25 | 4.75 |
| 0.794000000000001 | 0.75 | 2.25 | 4.75 |
| 0.795000000000001 | 0.75 | 2.25 | 4.75 |
| 0.796000000000001 | 0.75 | 2.25 | 4.75 |
| 0.797000000000001 | 0.75 | 2.25 | 4.75 |
| 0.798000000000001 | 0.75 | 2.25 | 4.75 |
| 0.799000000000001 | 0.75 | 2.25 | 4.75 |
| 0.800000000000001 | 0.75 | 2.25 | 4.75 |
| 0.801000000000001 | 0.75 | 2.25 | 4.75 |
| 0.802000000000001 | 0.75 | 2.25 | 4.75 |
| 0.803000000000001 | 0.75 | 2.25 | 4.75 |
| 0.804000000000001 | 0.75 | 2.25 | 4.75 |
| 0.805000000000001 | 0.75 | 2.25 | 4.75 |
| 0.806000000000001 | 0.75 | 2.25 | 4.75 |
| 0.807000000000001 | 0.75 | 2.25 | 4.75 |
| 0.808000000000001 | 0.75 | 2.25 | 4.75 |
| 0.809000000000001 | 0.75 | 2.25 | 4.75 |
| 0.810000000000001 | 0.75 | 2.25 | 4.75 |
| 0.811000000000001 | 0.75 | 2.25 | 4.75 |
| 0.812000000000001 | 0.75 | 2.25 | 4.75 |
| 0.813000000000001 | 0.75 | 2.25 | 4.75 |
| 0.814000000000001 | 0.75 | 2.25 | 4.75 |
| 0.815000000000001 | 0.75 | 2.25 | 4.75 |
| 0.816000000000001 | 0.75 | 2.25 | 4.75 |
| 0.817000000000001 | 0.75 | 2.25 | 4.75 |
| 0.818000000000001 | 0.75 | 2.25 | 4.75 |
| 0.819000000000001 | 0.75 | 2.25 | 4.75 |
| 0.820000000000001 | 0.75 | 2.25 | 4.75 |
| 0.821000000000001 | 0.75 | 2.25 | 4.75 |
| 0.822000000000001 | 0.75 | 2.25 | 4.75 |
| 0.823000000000001 | 0.75 | 2.25 | 4.75 |
| 0.824000000000001 | 0.75 | 2.25 | 4.75 |
| 0.825000000000001 | 0.75 | 2.25 | 4.75 |
| 0.826000000000001 | 0.75 | 2.25 | 4.75 |
| 0.827000000000001 | 0.75 | 2.25 | 4.75 |
| 0.828000000000001 | 0.75 | 2.25 | 4.75 |
| 0.829000000000001 | 0.75 | 2.25 | 4.75 |
| 0.830000000000001 | 0.75 | 2.25 | 4.75 |
| 0.831000000000001 | 0.75 | 2.25 | 4.75 |
| 0.832000000000001 | 0.75 | 2.25 | 4.75 |
| 0.833000000000001 | 0.75 | 2.25 | 4.75 |
| 0.834000000000001 | 0.75 | 2.25 | 4.75 |
| 0.835000000000001 | 0.75 | 2.25 | 4.75 |
| 0.836000000000001 | 0.75 | 2.25 | 4.75 |
| 0.837000000000001 | 0.75 | 2.25 | 4.75 |
| 0.838000000000001 | 0.75 | 2.25 | 4.75 |
| 0.839000000000001 | 0.75 | 2.25 | 4.75 |
| 0.840000000000001 | 0.75 | 2.25 | 4.75 |
| 0.841000000000001 | 0.75 | 2.25 | 4.75 |
| 0.842000000000001 | 0.75 | 2.25 | 4.75 |
| 0.843000000000001 | 0.75 | 2.25 | 4.75 |
| 0.844000000000001 | 0.75 | 2.25 | 4.75 |
| 0.845000000000001 | 0.75 | 2.25 | 4.75 |
| 0.846000000000001 | 0.75 | 2.25 | 4.75 |
| 0.847000000000001 | 0.75 | 2.25 | 4.75 |
| 0.848000000000001 | 0.75 | 2.25 | 4.75 |
| 0.849000000000001 | 0.75 | 2.25 | 4.75 |
| 0.850000000000001 | 0.75 | 2.25 | 4.75 |
| 0.851000000000001 | 0.75 | 2.25 | 4.75 |
| 0.852000000000001 | 0.75 | 2.25 | 4.75 |
| 0.853000000000001 | 0.75 | 2.25 | 4.75 |
| 0.854000000000001 | 0.75 | 2.25 | 4.75 |
| 0.855000000000001 | 0.75 | 2.25 | 4.75 |
| 0.856000000000001 | 0.75 | 2.25 | 4.75 |
| 0.857000000000001 | 0.75 | 2.25 | 4.75 |
| 0.858000000000001 | 0.75 | 2.25 | 4.75 |
| 0.859000000000001 | 0.75 | 2.25 | 4.75 |
| 0.860000000000001 | 0.75 | 2.25 | 4.75 |
| 0.861000000000001 | 0.75 | 2.25 | 4.75 |
| 0.862000000000001 | 0.75 | 2.25 | 4.75 |
| 0.863000000000001 | 0.75 | 2.25 | 4.75 |
| 0.864000000000001 | 0.75 | 2.25 | 4.75 |
| 0.865000000000001 | 0.75 | 2.25 | 4.75 |
| 0.866000000000001 | 0.75 | 2.25 | 4.75 |
| 0.867000000000001 | 0.75 | 2.25 | 4.75 |
| 0.868000000000001 | 0.75 | 2.25 | 4.75 |
| 0.869000000000001 | 0.75 | 2.25 | 4.75 |
| 0.870000000000001 | 0.75 | 2.25 | 4.75 |
| 0.871000000000001 | 0.75 | 2.25 | 4.75 |
| 0.872000000000001 | 0.75 | 2.25 | 4.75 |
| 0.873000000000001 | 0.75 | 2.25 | 4.75 |
| 0.874000000000001 | 0.75 | 2.25 | 4.75 |
| 0.875000000000001 | 0.75 | 2.25 | 4.75 |
| 0.876000000000001 | 0.75 | 2.25 | 4.75 |
| 0.877000000000001 | 0.75 | 2.25 | 4.75 |
| 0.878000000000001 | 0.75 | 2.25 | 4.75 |
| 0.879000000000001 | 0.75 | 2.25 | 4.75 |
| 0.880000000000001 | 0.75 | 2.25 | 4.75 |
| 0.881000000000001 | 0.75 | 2.25 | 4.75 |
| 0.882000000000001 | 0.75 | 2.25 | 4.75 |
| 0.883000000000001 | 0.75 | 2.25 | 4.75 |
| 0.884000000000001 | 0.75 | 2.25 | 4.75 |
| 0.885000000000001 | 0.75 | 2.25 | 4.75 |
| 0.886000000000001 | 0.75 | 2.25 | 4.75 |
| 0.887000000000001 | 0.75 | 2.25 | 4.75 |
| 0.888000000000001 | 0.75 | 2.25 | 4.75 |
| 0.889000000000001 | 0.75 | 2.25 | 4.75 |
| 0.890000000000001 | 0.75 | 2.25 | 4.75 |
| 0.891000000000001 | 0.75 | 2.25 | 4.75 |
| 0.892000000000001 | 0.75 | 2.25 | 4.75 |
| 0.893000000000001 | 0.75 | 2.25 | 4.75 |
| 0.894000000000001 | 0.75 | 2.25 | 4.75 |
| 0.895000000000001 | 0.75 | 2.25 | 4.75 |
| 0.896000000000001 | 0.75 | 2.25 | 4.75 |
| 0.897000000000001 | 0.75 | 2.25 | 4.75 |
| 0.898000000000001 | 0.75 | 2.25 | 4.75 |
| 0.899000000000001 | 0.75 | 2.25 | 4.75 |
| 0.900000000000001 | 0.75 | 2.25 | 4.75 |
| 0.901000000000001 | 0.75 | 2.25 | 4.75 |
| 0.902000000000001 | 0.75 | 2.25 | 4.75 |
| 0.903000000000001 | 0.75 | 2.25 | 4.75 |
| 0.904000000000001 | 0.75 | 2.25 | 4.75 |
| 0.905000000000001 | 0.75 | 2.25 | 4.75 |
| 0.906000000000001 | 0.75 | 2.25 | 4.75 |
| 0.907000000000001 | 0.75 | 2.25 | 4.75 |
| 0.908000000000001 | 0.75 | 2.25 | 4.75 |
| 0.909000000000001 | 0.75 | 2.25 | 4.75 |
| 0.910000000000001 | 0.75 | 2.25 | 4.75 |
| 0.911000000000001 | 0.75 | 2.25 | 4.75 |
| 0.912000000000001 | 0.75 | 2.25 | 4.75 |
| 0.913000000000001 | 0.75 | 2.25 | 4.75 |
| 0.914000000000001 | 0.75 | 2.25 | 4.75 |
| 0.915000000000001 | 0.75 | 2.25 | 4.75 |
| 0.916000000000001 | 0.75 | 2.25 | 4.75 |
| 0.917000000000001 | 0.75 | 2.25 | 4.75 |
| 0.918000000000001 | 0.75 | 2.25 | 4.75 |
| 0.919000000000001 | 0.75 | 2.25 | 4.75 |
| 0.920000000000001 | 0.75 | 2.25 | 4.75 |
| 0.921000000000001 | 0.75 | 2.25 | 4.75 |
| 0.922000000000001 | 0.75 | 2.25 | 4.75 |
| 0.923000000000001 | 0.75 | 2.25 | 4.75 |
| 0.924000000000001 | 0.75 | 2.25 | 4.75 |
| 0.925000000000001 | 0.75 | 2.25 | 4.75 |
| 0.926000000000001 | 0.75 | 2.25 | 4.75 |
| 0.927000000000001 | 0.75 | 2.25 | 4.75 |
| 0.928000000000001 | 0.75 | 2.25 | 4.75 |
| 0.929000000000001 | 0.75 | 2.25 | 4.75 |
| 0.930000000000001 | 0.75 | 2.25 | 4.75 |
| 0.931000000000001 | 0.75 | 2.25 | 4.75 |
| 0.932000000000001 | 0.75 | 2.25 | 4.75 |
| 0.933000000000001 | 0.75 | 2.25 | 4.75 |
| 0.934000000000001 | 0.75 | 2.25 | 4.75 |
| 0.935000000000001 | 0.75 | 2.25 | 4.75 |
| 0.936000000000001 | 0.75 | 2.25 | 4.75 |
| 0.937000000000001 | 0.75 | 2.25 | 4.75 |
| 0.938000000000001 | 0.75 | 2.25 | 4.75 |
| 0.939000000000001 | 0.75 | 2.25 | 4.75 |
| 0.940000000000001 | 0.75 | 2.25 | 4.75 |
| 0.941000000000001 | 0.75 | 2.25 | 4.75 |
| 0.942000000000001 | 0.75 | 2.25 | 4.75 |
| 0.943000000000001 | 0.75 | 2.25 | 4.75 |
| 0.944000000000001 | 0.75 | 2.25 | 4.75 |
| 0.945000000000001 | 0.75 | 2.25 | 4.75 |
| 0.946000000000001 | 0.75 | 2.25 | 4.75 |
| 0.947000000000001 | 0.75 | 2.25 | 4.75 |
| 0.948000000000001 | 0.75 | 2.25 | 4.75 |
| 0.949000000000001 | 0.75 | 2.25 | 4.75 |
| 0.950000000000001 | 0.75 | 2.25 | 4.75 |
| 0.951000000000001 | 0.75 | 2.25 | 4.75 |
| 0.952000000000001 | 0.75 | 2.25 | 4.75 |
| 0.953000000000001 | 0.75 | 2.25 | 4.75 |
| 0.954000000000001 | 0.75 | 2.25 | 4.75 |
| 0.955000000000001 | 0.75 | 2.25 | 4.75 |
| 0.956000000000001 | 0.75 | 2.25 | 4.75 |
| 0.957000000000001 | 0.75 | 2.25 | 4.75 |
| 0.958000000000001 | 0.75 | 2.25 | 4.75 |
| 0.959000000000001 | 0.75 | 2.25 | 4.75 |
| 0.960000000000001 | 0.75 | 2.25 | 4.75 |
| 0.961000000000001 | 0.75 | 2.25 | 4.75 |
| 0.962000000000001 | 0.75 | 2.25 | 4.75 |
| 0.963000000000001 | 0.75 | 2.25 | 4.75 |
| 0.964000000000001 | 0.75 | 2.25 | 4.75 |
| 0.965000000000001 | 0.75 | 2.25 | 4.75 |
| 0.966000000000001 | 0.75 | 2.25 | 4.75 |
| 0.967000000000001 | 0.75 | 2.25 | 4.75 |
| 0.968000000000001 | 0.75 | 2.25 | 4.75 |
| 0.969000000000001 | 0.75 | 2.25 | 4.75 |
| 0.970000000000001 | 0.75 | 2.25 | 4.75 |
| 0.971000000000001 | 0.75 | 2.25 | 4.75 |
| 0.972000000000001 | 0.75 | 2.25 | 4.75 |
| 0.973000000000001 | 0.75 | 2.25 | 4.75 |
| 0.974000000000001 | 0.75 | 2.25 | 4.75 |
| 0.975000000000001 | 0.75 | 2.25 | 4.75 |
| 0.976000000000001 | 0.75 | 2.25 | 4.75 |
| 0.977000000000001 | 0.75 | 2.25 | 4.75 |
| 0.978000000000001 | 0.75 | 2.25 | 4.75 |
| 0.979000000000001 | 0.75 | 2.25 | 4.75 |
| 0.980000000000001 | 0.75 | 2.25 | 4.75 |
| 0.981000000000001 | 0.75 | 2.25 | 4.75 |
| 0.982000000000001 | 0.75 | 2.25 | 4.75 |
| 0.983000000000001 | 0.75 | 2.25 | 4.75 |
| 0.984000000000001 | 0.75 | 2.25 | 4.75 |
| 0.985000000000001 | 0.75 | 2.25 | 4.75 |
| 0.986000000000001 | 0.75 | 2.25 | 4.75 |
| 0.987000000000001 | 0.75 | 2.25 | 4.75 |
| 0.988000000000001 | 0.75 | 2.25 | 4.75 |
| 0.989000000000001 | 0.75 | 2.25 | 4.75 |
| 0.990000000000001 | 0.75 | 2.25 | 4.75 |
| 0.991000000000001 | 0.75 | 2.25 | 4.75 |
| 0.992000000000001 | 0.75 | 2.25 | 4.75 |
| 0.993000000000001 | 0.75 | 2.25 | 4.75 |
| 0.994000000000001 | 0.75 | 2.25 | 4.75 |
| 0.995000000000001 | 0.75 | 2.25 | 4.75 |
| 0.996000000000001 | 0.75 | 2.25 | 4.75 |
| 0.997000000000001 | 0.75 | 2.25 | 4.75 |
| 0.998000000000001 | 0.75 | 2.25 | 4.75 |
| 0.999000000000001 | 0.75 | 2.25 | 4.75 |
| 1.000000000000001 | 0.75 | 2.25 | 4.75 |
| 1.001000000000001 | 1.75 | 3.5 | 3.75 |
| 1.002 | 1.75 | 3.5 | 3.75 |
| 1.003 | 1.75 | 3.5 | 3.75 |
| 1.004 | 1.75 | 3.5 | 3.75 |
| 1.005 | 1.75 | 3.5 | 3.75 |
| 1.006 | 1.75 | 3.5 | 3.75 |
| 1.007 | 1.75 | 3.5 | 3.75 |
| 1.008 | 1.75 | 3.5 | 3.75 |
| 1.009 | 1.75 | 3.5 | 3.75 |
| 1.01 | 1.75 | 3.5 | 3.75 |
| 1.010999999999999 | 1.75 | 3.5 | 3.75 |
| 1.011999999999999 | 1.75 | 3.5 | 3.75 |
| 1.012999999999999 | 1.75 | 3.5 | 3.75 |
| 1.013999999999999 | 1.75 | 3.5 | 3.75 |
| 1.014999999999999 | 1.75 | 3.5 | 3.75 |
| 1.015999999999999 | 1.75 | 3.5 | 3.75 |
| 1.016999999999999 | 1.75 | 3.5 | 3.75 |
| 1.017999999999999 | 1.75 | 3.5 | 3.75 |
| 1.018999999999999 | 1.75 | 3.5 | 3.75 |
| 1.019999999999998 | 1.75 | 3.5 | 3.75 |
| 1.020999999999998 | 1.75 | 3.5 | 3.75 |
| 1.021999999999998 | 1.75 | 3.5 | 3.75 |
| 1.022999999999998 | 1.75 | 3.5 | 3.75 |
| 1.023999999999998 | 1.75 | 3.5 | 3.75 |
| 1.024999999999998 | 1.75 | 3.5 | 3.75 |
| 1.025999999999998 | 1.75 | 3.5 | 3.75 |
| 1.026999999999998 | 1.75 | 3.5 | 3.75 |
| 1.027999999999998 | 1.75 | 3.5 | 3.75 |
| 1.028999999999997 | 1.75 | 3.5 | 3.75 |
| 1.029999999999997 | 1.75 | 3.5 | 3.75 |
| 1.030999999999997 | 1.75 | 3.5 | 3.75 |
| 1.031999999999997 | 1.75 | 3.5 | 3.75 |
| 1.032999999999997 | 1.75 | 3.5 | 3.75 |
| 1.033999999999997 | 1.75 | 3.5 | 3.75 |
| 1.034999999999997 | 1.75 | 3.5 | 3.75 |
| 1.035999999999997 | 1.75 | 3.5 | 3.75 |
| 1.036999999999997 | 1.75 | 3.5 | 3.75 |
| 1.037999999999996 | 1.75 | 3.5 | 3.75 |
| 1.038999999999996 | 1.75 | 3.5 | 3.75 |
| 1.039999999999996 | 1.75 | 3.5 | 3.75 |
| 1.040999999999996 | 1.75 | 3.5 | 3.75 |
| 1.041999999999996 | 1.75 | 3.5 | 3.75 |
| 1.042999999999996 | 1.75 | 3.5 | 3.75 |
| 1.043999999999996 | 1.75 | 3.5 | 3.75 |
| 1.044999999999996 | 1.75 | 3.5 | 3.75 |
| 1.045999999999996 | 1.75 | 3.5 | 3.75 |
| 1.046999999999995 | 1.75 | 3.5 | 3.75 |
| 1.047999999999995 | 1.75 | 3.5 | 3.75 |
| 1.048999999999995 | 1.75 | 3.5 | 3.75 |
| 1.049999999999995 | 1.75 | 3.5 | 3.75 |
| 1.050999999999995 | 1.75 | 3.5 | 3.75 |
| 1.051999999999995 | 1.75 | 3.5 | 3.75 |
| 1.052999999999995 | 1.75 | 3.5 | 3.75 |
| 1.053999999999995 | 1.75 | 3.5 | 3.75 |
| 1.054999999999995 | 1.75 | 3.5 | 3.75 |
| 1.055999999999994 | 1.75 | 3.5 | 3.75 |
| 1.056999999999994 | 1.75 | 3.5 | 3.75 |
| 1.057999999999994 | 1.75 | 3.5 | 3.75 |
| 1.058999999999994 | 1.75 | 3.5 | 3.75 |
| 1.059999999999994 | 1.75 | 3.5 | 3.75 |
| 1.060999999999994 | 1.75 | 3.5 | 3.75 |
| 1.061999999999994 | 1.75 | 3.5 | 3.75 |
| 1.062999999999994 | 1.75 | 3.5 | 3.75 |
| 1.063999999999994 | 1.75 | 3.5 | 3.75 |
| 1.064999999999993 | 1.75 | 3.5 | 3.75 |
| 1.065999999999993 | 1.75 | 3.5 | 3.75 |
| 1.066999999999993 | 1.75 | 3.5 | 3.75 |
| 1.067999999999993 | 1.75 | 3.5 | 3.75 |
| 1.068999999999993 | 1.75 | 3.5 | 3.75 |
| 1.069999999999993 | 1.75 | 3.5 | 3.75 |
| 1.070999999999993 | 1.75 | 3.5 | 3.75 |
| 1.071999999999993 | 1.75 | 3.5 | 3.75 |
| 1.072999999999993 | 1.75 | 3.5 | 3.75 |
| 1.073999999999993 | 1.75 | 3.5 | 3.75 |
| 1.074999999999992 | 1.75 | 3.5 | 3.75 |
| 1.075999999999992 | 1.75 | 3.5 | 3.75 |
| 1.076999999999992 | 1.75 | 3.5 | 3.75 |
| 1.077999999999992 | 1.75 | 3.5 | 3.75 |
| 1.078999999999992 | 1.75 | 3.5 | 3.75 |
| 1.079999999999992 | 1.75 | 3.5 | 3.75 |
| 1.080999999999992 | 1.75 | 3.5 | 3.75 |
| 1.081999999999992 | 1.75 | 3.5 | 3.75 |
| 1.082999999999992 | 1.75 | 3.5 | 3.75 |
| 1.083999999999991 | 1.75 | 3.5 | 3.75 |
| 1.084999999999991 | 1.75 | 3.5 | 3.75 |
| 1.085999999999991 | 1.75 | 3.5 | 3.75 |
| 1.086999999999991 | 1.75 | 3.5 | 3.75 |
| 1.087999999999991 | 1.75 | 3.5 | 3.75 |
| 1.088999999999991 | 1.75 | 3.5 | 3.75 |
| 1.089999999999991 | 1.75 | 3.5 | 3.75 |
| 1.090999999999991 | 1.75 | 3.5 | 3.75 |
| 1.091999999999991 | 1.75 | 3.5 | 3.75 |
| 1.09299999999999 | 1.75 | 3.5 | 3.75 |
| 1.09399999999999 | 1.75 | 3.5 | 3.75 |
| 1.09499999999999 | 1.75 | 3.5 | 3.75 |
| 1.09599999999999 | 1.75 | 3.5 | 3.75 |
| 1.09699999999999 | 1.75 | 3.5 | 3.75 |
| 1.09799999999999 | 1.75 | 3.5 | 3.75 |
| 1.09899999999999 | 1.75 | 3.5 | 3.75 |
| 1.09999999999999 | 1.75 | 3.5 | 3.75 |
| 1.10099999999999 | 1.75 | 3.5 | 3.75 |
| 1.101999999999989 | 1.75 | 3.5 | 3.75 |
| 1.102999999999989 | 1.75 | 3.5 | 3.75 |
| 1.103999999999989 | 1.75 | 3.5 | 3.75 |
| 1.104999999999989 | 1.75 | 3.5 | 3.75 |
| 1.105999999999989 | 1.75 | 3.5 | 3.75 |
| 1.106999999999989 | 1.75 | 3.5 | 3.75 |
| 1.107999999999989 | 1.75 | 3.5 | 3.75 |
| 1.108999999999989 | 1.75 | 3.5 | 3.75 |
| 1.109999999999989 | 1.75 | 3.5 | 3.75 |
| 1.110999999999988 | 1.75 | 3.5 | 3.75 |
| 1.111999999999988 | 1.75 | 3.5 | 3.75 |
| 1.112999999999988 | 1.75 | 3.5 | 3.75 |
| 1.113999999999988 | 1.75 | 3.5 | 3.75 |
| 1.114999999999988 | 1.75 | 3.5 | 3.75 |
| 1.115999999999988 | 1.75 | 3.5 | 3.75 |
| 1.116999999999988 | 1.75 | 3.5 | 3.75 |
| 1.117999999999988 | 1.75 | 3.5 | 3.75 |
| 1.118999999999988 | 1.75 | 3.5 | 3.75 |
| 1.119999999999987 | 1.75 | 3.5 | 3.75 |
| 1.120999999999987 | 1.75 | 3.5 | 3.75 |
| 1.121999999999987 | 1.75 | 3.5 | 3.75 |
| 1.122999999999987 | 1.75 | 3.5 | 3.75 |
| 1.123999999999987 | 1.75 | 3.5 | 3.75 |
| 1.124999999999987 | 1.75 | 3.5 | 3.75 |
| 1.125999999999987 | 1.75 | 3.5 | 3.75 |
| 1.126999999999987 | 1.75 | 3.5 | 3.75 |
| 1.127999999999987 | 1.75 | 3.5 | 3.75 |
| 1.128999999999986 | 1.75 | 3.5 | 3.75 |
| 1.129999999999986 | 1.75 | 3.5 | 3.75 |
| 1.130999999999986 | 1.75 | 3.5 | 3.75 |
| 1.131999999999986 | 1.75 | 3.5 | 3.75 |
| 1.132999999999986 | 1.75 | 3.5 | 3.75 |
| 1.133999999999986 | 1.75 | 3.5 | 3.75 |
| 1.134999999999986 | 1.75 | 3.5 | 3.75 |
| 1.135999999999986 | 1.75 | 3.5 | 3.75 |
| 1.136999999999986 | 1.75 | 3.5 | 3.75 |
| 1.137999999999985 | 1.75 | 3.5 | 3.75 |
| 1.138999999999985 | 1.75 | 3.5 | 3.75 |
| 1.139999999999985 | 1.75 | 3.5 | 3.75 |
| 1.140999999999985 | 1.75 | 3.5 | 3.75 |
| 1.141999999999985 | 1.75 | 3.5 | 3.75 |
| 1.142999999999985 | 1.75 | 3.5 | 3.75 |
| 1.143999999999985 | 1.75 | 3.5 | 3.75 |
| 1.144999999999985 | 1.75 | 3.5 | 3.75 |
| 1.145999999999985 | 1.75 | 3.5 | 3.75 |
| 1.146999999999984 | 1.75 | 3.5 | 3.75 |
| 1.147999999999984 | 1.75 | 3.5 | 3.75 |
| 1.148999999999984 | 1.75 | 3.5 | 3.75 |
| 1.149999999999984 | 1.75 | 3.5 | 3.75 |
| 1.150999999999984 | 1.75 | 3.5 | 3.75 |
| 1.151999999999984 | 1.75 | 3.5 | 3.75 |
| 1.152999999999984 | 1.75 | 3.5 | 3.75 |
| 1.153999999999984 | 1.75 | 3.5 | 3.75 |
| 1.154999999999984 | 1.75 | 3.5 | 3.75 |
| 1.155999999999983 | 1.75 | 3.5 | 3.75 |
| 1.156999999999983 | 1.75 | 3.5 | 3.75 |
| 1.157999999999983 | 1.75 | 3.5 | 3.75 |
| 1.158999999999983 | 1.75 | 3.5 | 3.75 |
| 1.159999999999983 | 1.75 | 3.5 | 3.75 |
| 1.160999999999983 | 1.75 | 3.5 | 3.75 |
| 1.161999999999983 | 1.75 | 3.5 | 3.75 |
| 1.162999999999983 | 1.75 | 3.5 | 3.75 |
| 1.163999999999983 | 1.75 | 3.5 | 3.75 |
| 1.164999999999982 | 1.75 | 3.5 | 3.75 |
| 1.165999999999982 | 1.75 | 3.5 | 3.75 |
| 1.166999999999982 | 1.75 | 3.5 | 3.75 |
| 1.167999999999982 | 1.75 | 3.5 | 3.75 |
| 1.168999999999982 | 1.75 | 3.5 | 3.75 |
| 1.169999999999982 | 1.75 | 3.5 | 3.75 |
| 1.170999999999982 | 1.75 | 3.5 | 3.75 |
| 1.171999999999982 | 1.75 | 3.5 | 3.75 |
| 1.172999999999982 | 1.75 | 3.5 | 3.75 |
| 1.173999999999981 | 1.75 | 3.5 | 3.75 |
| 1.174999999999981 | 1.75 | 3.5 | 3.75 |
| 1.175999999999981 | 1.75 | 3.5 | 3.75 |
| 1.176999999999981 | 1.75 | 3.5 | 3.75 |
| 1.177999999999981 | 1.75 | 3.5 | 3.75 |
| 1.178999999999981 | 1.75 | 3.5 | 3.75 |
| 1.179999999999981 | 1.75 | 3.5 | 3.75 |
| 1.180999999999981 | 1.75 | 3.5 | 3.75 |
| 1.181999999999981 | 1.75 | 3.5 | 3.75 |
| 1.18299999999998 | 1.75 | 3.5 | 3.75 |
| 1.18399999999998 | 1.75 | 3.5 | 3.75 |
| 1.18499999999998 | 1.75 | 3.5 | 3.75 |
| 1.18599999999998 | 1.75 | 3.5 | 3.75 |
| 1.18699999999998 | 1.75 | 3.5 | 3.75 |
| 1.18799999999998 | 1.75 | 3.5 | 3.75 |
| 1.18899999999998 | 1.75 | 3.5 | 3.75 |
| 1.18999999999998 | 1.75 | 3.5 | 3.75 |
| 1.19099999999998 | 1.75 | 3.5 | 3.75 |
| 1.191999999999979 | 1.75 | 3.5 | 3.75 |
| 1.192999999999979 | 1.75 | 3.5 | 3.75 |
| 1.193999999999979 | 1.75 | 3.5 | 3.75 |
| 1.194999999999979 | 1.75 | 3.5 | 3.75 |
| 1.195999999999979 | 1.75 | 3.5 | 3.75 |
| 1.196999999999979 | 1.75 | 3.5 | 3.75 |
| 1.197999999999979 | 1.75 | 3.5 | 3.75 |
| 1.198999999999979 | 1.75 | 3.5 | 3.75 |
| 1.199999999999979 | 1.75 | 3.5 | 3.75 |
| 1.200999999999979 | 1.75 | 3.5 | 3.75 |
| 1.201999999999978 | 1.75 | 3.5 | 3.75 |
| 1.202999999999978 | 1.75 | 3.5 | 3.75 |
| 1.203999999999978 | 1.75 | 3.5 | 3.75 |
| 1.204999999999978 | 1.75 | 3.5 | 3.75 |
| 1.205999999999978 | 1.75 | 3.5 | 3.75 |
| 1.206999999999978 | 1.75 | 3.5 | 3.75 |
| 1.207999999999978 | 1.75 | 3.5 | 3.75 |
| 1.208999999999978 | 1.75 | 3.5 | 3.75 |
| 1.209999999999978 | 1.75 | 3.5 | 3.75 |
| 1.210999999999977 | 1.75 | 3.5 | 3.75 |
| 1.211999999999977 | 1.75 | 3.5 | 3.75 |
| 1.212999999999977 | 1.75 | 3.5 | 3.75 |
| 1.213999999999977 | 1.75 | 3.5 | 3.75 |
| 1.214999999999977 | 1.75 | 3.5 | 3.75 |
| 1.215999999999977 | 1.75 | 3.5 | 3.75 |
| 1.216999999999977 | 1.75 | 3.5 | 3.75 |
| 1.217999999999977 | 1.75 | 3.5 | 3.75 |
| 1.218999999999977 | 1.75 | 3.5 | 3.75 |
| 1.219999999999976 | 1.75 | 3.5 | 3.75 |
| 1.220999999999976 | 1.75 | 3.5 | 3.75 |
| 1.221999999999976 | 1.75 | 3.5 | 3.75 |
| 1.222999999999976 | 1.75 | 3.5 | 3.75 |
| 1.223999999999976 | 1.75 | 3.5 | 3.75 |
| 1.224999999999976 | 1.75 | 3.5 | 3.75 |
| 1.225999999999976 | 1.75 | 3.5 | 3.75 |
| 1.226999999999976 | 1.75 | 3.5 | 3.75 |
| 1.227999999999976 | 1.75 | 3.5 | 3.75 |
| 1.228999999999975 | 1.75 | 3.5 | 3.75 |
| 1.229999999999975 | 1.75 | 3.5 | 3.75 |
| 1.230999999999975 | 1.75 | 3.5 | 3.75 |
| 1.231999999999975 | 1.75 | 3.5 | 3.75 |
| 1.232999999999975 | 1.75 | 3.5 | 3.75 |
| 1.233999999999975 | 1.75 | 3.5 | 3.75 |
| 1.234999999999975 | 1.75 | 3.5 | 3.75 |
| 1.235999999999975 | 1.75 | 3.5 | 3.75 |
| 1.236999999999975 | 1.75 | 3.5 | 3.75 |
| 1.237999999999974 | 1.75 | 3.5 | 3.75 |
| 1.238999999999974 | 1.75 | 3.5 | 3.75 |
| 1.239999999999974 | 1.75 | 3.5 | 3.75 |
| 1.240999999999974 | 1.75 | 3.5 | 3.75 |
| 1.241999999999974 | 1.75 | 3.5 | 3.75 |
| 1.242999999999974 | 1.75 | 3.5 | 3.75 |
| 1.243999999999974 | 1.75 | 3.5 | 3.75 |
| 1.244999999999974 | 1.75 | 3.5 | 3.75 |
| 1.245999999999974 | 1.75 | 3.5 | 3.75 |
| 1.246999999999973 | 1.75 | 3.5 | 3.75 |
| 1.247999999999973 | 1.75 | 3.5 | 3.75 |
| 1.248999999999973 | 1.75 | 3.5 | 3.75 |
| 1.249999999999973 | 1.75 | 3.5 | 3.75 |
| 1.250999999999973 | 1.75 | 3.5 | 3.75 |
| 1.251999999999973 | 1.75 | 3.5 | 3.75 |
| 1.252999999999973 | 1.75 | 3.5 | 3.75 |
| 1.253999999999973 | 1.75 | 3.5 | 3.75 |
| 1.254999999999973 | 1.75 | 3.5 | 3.75 |
| 1.255999999999972 | 1.75 | 3.5 | 3.75 |
| 1.256999999999972 | 1.75 | 3.5 | 3.75 |
| 1.257999999999972 | 1.75 | 3.5 | 3.75 |
| 1.258999999999972 | 1.75 | 3.5 | 3.75 |
| 1.259999999999972 | 1.75 | 3.5 | 3.75 |
| 1.260999999999972 | 1.75 | 3.5 | 3.75 |
| 1.261999999999972 | 1.75 | 3.5 | 3.75 |
| 1.262999999999972 | 1.75 | 3.5 | 3.75 |
| 1.263999999999972 | 1.75 | 3.5 | 3.75 |
| 1.264999999999971 | 1.75 | 3.5 | 3.75 |
| 1.265999999999971 | 1.75 | 3.5 | 3.75 |
| 1.266999999999971 | 1.75 | 3.5 | 3.75 |
| 1.267999999999971 | 1.75 | 3.5 | 3.75 |
| 1.268999999999971 | 1.75 | 3.5 | 3.75 |
| 1.269999999999971 | 1.75 | 3.5 | 3.75 |
| 1.270999999999971 | 1.75 | 3.5 | 3.75 |
| 1.271999999999971 | 1.75 | 3.5 | 3.75 |
| 1.272999999999971 | 1.75 | 3.5 | 3.75 |
| 1.27399999999997 | 1.75 | 3.5 | 3.75 |
| 1.27499999999997 | 1.75 | 3.5 | 3.75 |
| 1.27599999999997 | 1.75 | 3.5 | 3.75 |
| 1.27699999999997 | 1.75 | 3.5 | 3.75 |
| 1.27799999999997 | 1.75 | 3.5 | 3.75 |
| 1.27899999999997 | 1.75 | 3.5 | 3.75 |
| 1.27999999999997 | 1.75 | 3.5 | 3.75 |
| 1.28099999999997 | 1.75 | 3.5 | 3.75 |
| 1.28199999999997 | 1.75 | 3.5 | 3.75 |
| 1.282999999999969 | 1.75 | 3.5 | 3.75 |
| 1.283999999999969 | 1.75 | 3.5 | 3.75 |
| 1.284999999999969 | 1.75 | 3.5 | 3.75 |
| 1.285999999999969 | 1.75 | 3.5 | 3.75 |
| 1.286999999999969 | 1.75 | 3.5 | 3.75 |
| 1.287999999999969 | 1.75 | 3.5 | 3.75 |
| 1.288999999999969 | 1.75 | 3.5 | 3.75 |
| 1.289999999999969 | 1.75 | 3.5 | 3.75 |
| 1.290999999999969 | 1.75 | 3.5 | 3.75 |
| 1.291999999999968 | 1.75 | 3.5 | 3.75 |
| 1.292999999999968 | 1.75 | 3.5 | 3.75 |
| 1.293999999999968 | 1.75 | 3.5 | 3.75 |
| 1.294999999999968 | 1.75 | 3.5 | 3.75 |
| 1.295999999999968 | 1.75 | 3.5 | 3.75 |
| 1.296999999999968 | 1.75 | 3.5 | 3.75 |
| 1.297999999999968 | 1.75 | 3.5 | 3.75 |
| 1.298999999999968 | 1.75 | 3.5 | 3.75 |
| 1.299999999999968 | 1.75 | 3.5 | 3.75 |
| 1.300999999999967 | 1.75 | 3.5 | 3.75 |
| 1.301999999999967 | 1.75 | 3.5 | 3.75 |
| 1.302999999999967 | 1.75 | 3.5 | 3.75 |
| 1.303999999999967 | 1.75 | 3.5 | 3.75 |
| 1.304999999999967 | 1.75 | 3.5 | 3.75 |
| 1.305999999999967 | 1.75 | 3.5 | 3.75 |
| 1.306999999999967 | 1.75 | 3.5 | 3.75 |
| 1.307999999999967 | 1.75 | 3.5 | 3.75 |
| 1.308999999999967 | 1.75 | 3.5 | 3.75 |
| 1.309999999999966 | 1.75 | 3.5 | 3.75 |
| 1.310999999999966 | 1.75 | 3.5 | 3.75 |
| 1.311999999999966 | 1.75 | 3.5 | 3.75 |
| 1.312999999999966 | 1.75 | 3.5 | 3.75 |
| 1.313999999999966 | 1.75 | 3.5 | 3.75 |
| 1.314999999999966 | 1.75 | 3.5 | 3.75 |
| 1.315999999999966 | 1.75 | 3.5 | 3.75 |
| 1.316999999999966 | 1.75 | 3.5 | 3.75 |
| 1.317999999999966 | 1.75 | 3.5 | 3.75 |
| 1.318999999999965 | 1.75 | 3.5 | 3.75 |
| 1.319999999999965 | 1.75 | 3.5 | 3.75 |
| 1.320999999999965 | 1.75 | 3.5 | 3.75 |
| 1.321999999999965 | 1.75 | 3.5 | 3.75 |
| 1.322999999999965 | 1.75 | 3.5 | 3.75 |
| 1.323999999999965 | 1.75 | 3.5 | 3.75 |
| 1.324999999999965 | 1.75 | 3.5 | 3.75 |
| 1.325999999999965 | 1.75 | 3.5 | 3.75 |
| 1.326999999999965 | 1.75 | 3.5 | 3.75 |
| 1.327999999999964 | 1.75 | 3.5 | 3.75 |
| 1.328999999999964 | 1.75 | 3.5 | 3.75 |
| 1.329999999999964 | 1.75 | 3.5 | 3.75 |
| 1.330999999999964 | 1.75 | 3.5 | 3.75 |
| 1.331999999999964 | 1.75 | 3.5 | 3.75 |
| 1.332999999999964 | 1.75 | 3.5 | 3.75 |
| 1.333999999999964 | 1.75 | 3.5 | 3.75 |
| 1.334999999999964 | 1.75 | 3.5 | 3.75 |
| 1.335999999999964 | 1.75 | 3.5 | 3.75 |
| 1.336999999999963 | 1.75 | 3.5 | 3.75 |
| 1.337999999999963 | 1.75 | 3.5 | 3.75 |
| 1.338999999999963 | 1.75 | 3.5 | 3.75 |
| 1.339999999999963 | 1.75 | 3.5 | 3.75 |
| 1.340999999999963 | 1.75 | 3.5 | 3.75 |
| 1.341999999999963 | 1.75 | 3.5 | 3.75 |
| 1.342999999999963 | 1.75 | 3.5 | 3.75 |
| 1.343999999999963 | 1.75 | 3.5 | 3.75 |
| 1.344999999999963 | 1.75 | 3.5 | 3.75 |
| 1.345999999999963 | 1.75 | 3.5 | 3.75 |
| 1.346999999999962 | 1.75 | 3.5 | 3.75 |
| 1.347999999999962 | 1.75 | 3.5 | 3.75 |
| 1.348999999999962 | 1.75 | 3.5 | 3.75 |
| 1.349999999999962 | 1.75 | 3.5 | 3.75 |
| 1.350999999999962 | 1.75 | 3.5 | 3.75 |
| 1.351999999999962 | 1.75 | 3.5 | 3.75 |
| 1.352999999999962 | 1.75 | 3.5 | 3.75 |
| 1.353999999999962 | 1.75 | 3.5 | 3.75 |
| 1.354999999999962 | 1.75 | 3.5 | 3.75 |
| 1.355999999999961 | 1.75 | 3.5 | 3.75 |
| 1.356999999999961 | 1.75 | 3.5 | 3.75 |
| 1.357999999999961 | 1.75 | 3.5 | 3.75 |
| 1.358999999999961 | 1.75 | 3.5 | 3.75 |
| 1.359999999999961 | 1.75 | 3.5 | 3.75 |
| 1.360999999999961 | 1.75 | 3.5 | 3.75 |
| 1.361999999999961 | 1.75 | 3.5 | 3.75 |
| 1.362999999999961 | 1.75 | 3.5 | 3.75 |
| 1.363999999999961 | 1.75 | 3.5 | 3.75 |
| 1.36499999999996 | 1.75 | 3.5 | 3.75 |
| 1.36599999999996 | 1.75 | 3.5 | 3.75 |
| 1.36699999999996 | 1.75 | 3.5 | 3.75 |
| 1.36799999999996 | 1.75 | 3.5 | 3.75 |
| 1.36899999999996 | 1.75 | 3.5 | 3.75 |
| 1.36999999999996 | 1.75 | 3.5 | 3.75 |
| 1.37099999999996 | 1.75 | 3.5 | 3.75 |
| 1.37199999999996 | 1.75 | 3.5 | 3.75 |
| 1.37299999999996 | 1.75 | 3.5 | 3.75 |
| 1.373999999999959 | 1.75 | 3.5 | 3.75 |
| 1.374999999999959 | 1.75 | 3.5 | 3.75 |
| 1.375999999999959 | 1.75 | 3.5 | 3.75 |
| 1.376999999999959 | 1.75 | 3.5 | 3.75 |
| 1.377999999999959 | 1.75 | 3.5 | 3.75 |
| 1.378999999999959 | 1.75 | 3.5 | 3.75 |
| 1.379999999999959 | 1.75 | 3.5 | 3.75 |
| 1.380999999999959 | 1.75 | 3.5 | 3.75 |
| 1.381999999999959 | 1.75 | 3.5 | 3.75 |
| 1.382999999999958 | 1.75 | 3.5 | 3.75 |
| 1.383999999999958 | 1.75 | 3.5 | 3.75 |
| 1.384999999999958 | 1.75 | 3.5 | 3.75 |
| 1.385999999999958 | 1.75 | 3.5 | 3.75 |
| 1.386999999999958 | 1.75 | 3.5 | 3.75 |
| 1.387999999999958 | 1.75 | 3.5 | 3.75 |
| 1.388999999999958 | 1.75 | 3.5 | 3.75 |
| 1.389999999999958 | 1.75 | 3.5 | 3.75 |
| 1.390999999999958 | 1.75 | 3.5 | 3.75 |
| 1.391999999999957 | 1.75 | 3.5 | 3.75 |
| 1.392999999999957 | 1.75 | 3.5 | 3.75 |
| 1.393999999999957 | 1.75 | 3.5 | 3.75 |
| 1.394999999999957 | 1.75 | 3.5 | 3.75 |
| 1.395999999999957 | 1.75 | 3.5 | 3.75 |
| 1.396999999999957 | 1.75 | 3.5 | 3.75 |
| 1.397999999999957 | 1.75 | 3.5 | 3.75 |
| 1.398999999999957 | 1.75 | 3.5 | 3.75 |
| 1.399999999999957 | 1.75 | 3.5 | 3.75 |
| 1.400999999999956 | 1.75 | 3.5 | 3.75 |
| 1.401999999999956 | 1.75 | 3.5 | 3.75 |
| 1.402999999999956 | 1.75 | 3.5 | 3.75 |
| 1.403999999999956 | 1.75 | 3.5 | 3.75 |
| 1.404999999999956 | 1.75 | 3.5 | 3.75 |
| 1.405999999999956 | 1.75 | 3.5 | 3.75 |
| 1.406999999999956 | 1.75 | 3.5 | 3.75 |
| 1.407999999999956 | 1.75 | 3.5 | 3.75 |
| 1.408999999999956 | 1.75 | 3.5 | 3.75 |
| 1.409999999999955 | 1.75 | 3.5 | 3.75 |
| 1.410999999999955 | 1.75 | 3.5 | 3.75 |
| 1.411999999999955 | 1.75 | 3.5 | 3.75 |
| 1.412999999999955 | 1.75 | 3.5 | 3.75 |
| 1.413999999999955 | 1.75 | 3.5 | 3.75 |
| 1.414999999999955 | 1.75 | 3.5 | 3.75 |
| 1.415999999999955 | 1.75 | 3.5 | 3.75 |
| 1.416999999999955 | 1.75 | 3.5 | 3.75 |
| 1.417999999999955 | 1.75 | 3.5 | 3.75 |
| 1.418999999999954 | 1.75 | 3.5 | 3.75 |
| 1.419999999999954 | 1.75 | 3.5 | 3.75 |
| 1.420999999999954 | 1.75 | 3.5 | 3.75 |
| 1.421999999999954 | 1.75 | 3.5 | 3.75 |
| 1.422999999999954 | 1.75 | 3.5 | 3.75 |
| 1.423999999999954 | 1.75 | 3.5 | 3.75 |
| 1.424999999999954 | 1.75 | 3.5 | 3.75 |
| 1.425999999999954 | 1.75 | 3.5 | 3.75 |
| 1.426999999999954 | 1.75 | 3.5 | 3.75 |
| 1.427999999999954 | 1.75 | 3.5 | 3.75 |
| 1.428999999999953 | 1.75 | 3.5 | 3.75 |
| 1.429999999999953 | 1.75 | 3.5 | 3.75 |
| 1.430999999999953 | 1.75 | 3.5 | 3.75 |
| 1.431999999999953 | 1.75 | 3.5 | 3.75 |
| 1.432999999999953 | 1.75 | 3.5 | 3.75 |
| 1.433999999999953 | 1.75 | 3.5 | 3.75 |
| 1.434999999999953 | 1.75 | 3.5 | 3.75 |
| 1.435999999999953 | 1.75 | 3.5 | 3.75 |
| 1.436999999999953 | 1.75 | 3.5 | 3.75 |
| 1.437999999999952 | 1.75 | 3.5 | 3.75 |
| 1.438999999999952 | 1.75 | 3.5 | 3.75 |
| 1.439999999999952 | 1.75 | 3.5 | 3.75 |
| 1.440999999999952 | 1.75 | 3.5 | 3.75 |
| 1.441999999999952 | 1.75 | 3.5 | 3.75 |
| 1.442999999999952 | 1.75 | 3.5 | 3.75 |
| 1.443999999999952 | 1.75 | 3.5 | 3.75 |
| 1.444999999999952 | 1.75 | 3.5 | 3.75 |
| 1.445999999999952 | 1.75 | 3.5 | 3.75 |
| 1.446999999999951 | 1.75 | 3.5 | 3.75 |
| 1.447999999999951 | 1.75 | 3.5 | 3.75 |
| 1.448999999999951 | 1.75 | 3.5 | 3.75 |
| 1.449999999999951 | 1.75 | 3.5 | 3.75 |
| 1.450999999999951 | 1.75 | 3.5 | 3.75 |
| 1.451999999999951 | 1.75 | 3.5 | 3.75 |
| 1.452999999999951 | 1.75 | 3.5 | 3.75 |
| 1.453999999999951 | 1.75 | 3.5 | 3.75 |
| 1.454999999999951 | 1.75 | 3.5 | 3.75 |
| 1.45599999999995 | 1.75 | 3.5 | 3.75 |
| 1.45699999999995 | 1.75 | 3.5 | 3.75 |
| 1.45799999999995 | 1.75 | 3.5 | 3.75 |
| 1.45899999999995 | 1.75 | 3.5 | 3.75 |
| 1.45999999999995 | 1.75 | 3.5 | 3.75 |
| 1.46099999999995 | 1.75 | 3.5 | 3.75 |
| 1.46199999999995 | 1.75 | 3.5 | 3.75 |
| 1.46299999999995 | 1.75 | 3.5 | 3.75 |
| 1.46399999999995 | 1.75 | 3.5 | 3.75 |
| 1.464999999999949 | 1.75 | 3.5 | 3.75 |
| 1.465999999999949 | 1.75 | 3.5 | 3.75 |
| 1.466999999999949 | 1.75 | 3.5 | 3.75 |
| 1.467999999999949 | 1.75 | 3.5 | 3.75 |
| 1.468999999999949 | 1.75 | 3.5 | 3.75 |
| 1.469999999999949 | 1.75 | 3.5 | 3.75 |
| 1.470999999999949 | 1.75 | 3.5 | 3.75 |
| 1.471999999999949 | 1.75 | 3.5 | 3.75 |
| 1.472999999999949 | 1.75 | 3.5 | 3.75 |
| 1.473999999999948 | 1.75 | 3.5 | 3.75 |
| 1.474999999999948 | 1.75 | 3.5 | 3.75 |
| 1.475999999999948 | 1.75 | 3.5 | 3.75 |
| 1.476999999999948 | 1.75 | 3.5 | 3.75 |
| 1.477999999999948 | 1.75 | 3.5 | 3.75 |
| 1.478999999999948 | 1.75 | 3.5 | 3.75 |
| 1.479999999999948 | 1.75 | 3.5 | 3.75 |
| 1.480999999999948 | 1.75 | 3.5 | 3.75 |
| 1.481999999999948 | 1.75 | 3.5 | 3.75 |
| 1.482999999999947 | 1.75 | 3.5 | 3.75 |
| 1.483999999999947 | 1.75 | 3.5 | 3.75 |
| 1.484999999999947 | 1.75 | 3.5 | 3.75 |
| 1.485999999999947 | 1.75 | 3.5 | 3.75 |
| 1.486999999999947 | 1.75 | 3.5 | 3.75 |
| 1.487999999999947 | 1.75 | 3.5 | 3.75 |
| 1.488999999999947 | 1.75 | 3.5 | 3.75 |
| 1.489999999999947 | 1.75 | 3.5 | 3.75 |
| 1.490999999999947 | 1.75 | 3.5 | 3.75 |
| 1.491999999999946 | 1.75 | 3.5 | 3.75 |
| 1.492999999999946 | 1.75 | 3.5 | 3.75 |
| 1.493999999999946 | 1.75 | 3.5 | 3.75 |
| 1.494999999999946 | 1.75 | 3.5 | 3.75 |
| 1.495999999999946 | 1.75 | 3.5 | 3.75 |
| 1.496999999999946 | 1.75 | 3.5 | 3.75 |
| 1.497999999999946 | 1.75 | 3.5 | 3.75 |
| 1.498999999999946 | 1.75 | 3.5 | 3.75 |
| 1.499999999999946 | 1.75 | 3.5 | 3.75 |
| 1.500999999999945 | 1.75 | 3.5 | 3.75 |
| 1.501999999999945 | 1.75 | 3.5 | 3.75 |
| 1.502999999999945 | 1.75 | 3.5 | 3.75 |
| 1.503999999999945 | 1.75 | 3.5 | 3.75 |
| 1.504999999999945 | 1.75 | 3.5 | 3.75 |
| 1.505999999999945 | 1.75 | 3.5 | 3.75 |
| 1.506999999999945 | 1.75 | 3.5 | 3.75 |
| 1.507999999999945 | 1.75 | 3.5 | 3.75 |
| 1.508999999999945 | 1.75 | 3.5 | 3.75 |
| 1.509999999999944 | 1.75 | 3.5 | 3.75 |
| 1.510999999999944 | 1.75 | 3.5 | 3.75 |
| 1.511999999999944 | 1.75 | 3.5 | 3.75 |
| 1.512999999999944 | 1.75 | 3.5 | 3.75 |
| 1.513999999999944 | 1.75 | 3.5 | 3.75 |
| 1.514999999999944 | 1.75 | 3.5 | 3.75 |
| 1.515999999999944 | 1.75 | 3.5 | 3.75 |
| 1.516999999999944 | 1.75 | 3.5 | 3.75 |
| 1.517999999999944 | 1.75 | 3.5 | 3.75 |
| 1.518999999999944 | 1.75 | 3.5 | 3.75 |
| 1.519999999999943 | 1.75 | 3.5 | 3.75 |
| 1.520999999999943 | 1.75 | 3.5 | 3.75 |
| 1.521999999999943 | 1.75 | 3.5 | 3.75 |
| 1.522999999999943 | 1.75 | 3.5 | 3.75 |
| 1.523999999999943 | 1.75 | 3.5 | 3.75 |
| 1.524999999999943 | 1.75 | 3.5 | 3.75 |
| 1.525999999999943 | 1.75 | 3.5 | 3.75 |
| 1.526999999999943 | 1.75 | 3.5 | 3.75 |
| 1.527999999999943 | 1.75 | 3.5 | 3.75 |
| 1.528999999999942 | 1.75 | 3.5 | 3.75 |
| 1.529999999999942 | 1.75 | 3.5 | 3.75 |
| 1.530999999999942 | 1.75 | 3.5 | 3.75 |
| 1.531999999999942 | 1.75 | 3.5 | 3.75 |
| 1.532999999999942 | 1.75 | 3.5 | 3.75 |
| 1.533999999999942 | 1.75 | 3.5 | 3.75 |
| 1.534999999999942 | 1.75 | 3.5 | 3.75 |
| 1.535999999999942 | 1.75 | 3.5 | 3.75 |
| 1.536999999999942 | 1.75 | 3.5 | 3.75 |
| 1.537999999999941 | 1.75 | 3.5 | 3.75 |
| 1.538999999999941 | 1.75 | 3.5 | 3.75 |
| 1.539999999999941 | 1.75 | 3.5 | 3.75 |
| 1.540999999999941 | 1.75 | 3.5 | 3.75 |
| 1.541999999999941 | 1.75 | 3.5 | 3.75 |
| 1.542999999999941 | 1.75 | 3.5 | 3.75 |
| 1.543999999999941 | 1.75 | 3.5 | 3.75 |
| 1.544999999999941 | 1.75 | 3.5 | 3.75 |
| 1.545999999999941 | 1.75 | 3.5 | 3.75 |
| 1.54699999999994 | 1.75 | 3.5 | 3.75 |
| 1.54799999999994 | 1.75 | 3.5 | 3.75 |
| 1.54899999999994 | 1.75 | 3.5 | 3.75 |
| 1.54999999999994 | 1.75 | 3.5 | 3.75 |
| 1.55099999999994 | 1.75 | 3.5 | 3.75 |
| 1.55199999999994 | 1.75 | 3.5 | 3.75 |
| 1.55299999999994 | 1.75 | 3.5 | 3.75 |
| 1.55399999999994 | 1.75 | 3.5 | 3.75 |
| 1.55499999999994 | 1.75 | 3.5 | 3.75 |
| 1.555999999999939 | 1.75 | 3.5 | 3.75 |
| 1.556999999999939 | 1.75 | 3.5 | 3.75 |
| 1.557999999999939 | 1.75 | 3.5 | 3.75 |
| 1.558999999999939 | 1.75 | 3.5 | 3.75 |
| 1.559999999999939 | 1.75 | 3.5 | 3.75 |
| 1.560999999999939 | 1.75 | 3.5 | 3.75 |
| 1.561999999999939 | 1.75 | 3.5 | 3.75 |
| 1.562999999999939 | 1.75 | 3.5 | 3.75 |
| 1.563999999999939 | 1.75 | 3.5 | 3.75 |
| 1.564999999999938 | 1.75 | 3.5 | 3.75 |
| 1.565999999999938 | 1.75 | 3.5 | 3.75 |
| 1.566999999999938 | 1.75 | 3.5 | 3.75 |
| 1.567999999999938 | 1.75 | 3.5 | 3.75 |
| 1.568999999999938 | 1.75 | 3.5 | 3.75 |
| 1.569999999999938 | 1.75 | 3.5 | 3.75 |
| 1.570999999999938 | 1.75 | 3.5 | 3.75 |
| 1.571999999999938 | 1.75 | 3.5 | 3.75 |
| 1.572999999999938 | 1.75 | 3.5 | 3.75 |
| 1.573999999999937 | 1.75 | 3.5 | 3.75 |
| 1.574999999999937 | 1.75 | 3.5 | 3.75 |
| 1.575999999999937 | 1.75 | 3.5 | 3.75 |
| 1.576999999999937 | 1.75 | 3.5 | 3.75 |
| 1.577999999999937 | 1.75 | 3.5 | 3.75 |
| 1.578999999999937 | 1.75 | 3.5 | 3.75 |
| 1.579999999999937 | 1.75 | 3.5 | 3.75 |
| 1.580999999999937 | 1.75 | 3.5 | 3.75 |
| 1.581999999999937 | 1.75 | 3.5 | 3.75 |
| 1.582999999999936 | 1.75 | 3.5 | 3.75 |
| 1.583999999999936 | 1.75 | 3.5 | 3.75 |
| 1.584999999999936 | 1.75 | 3.5 | 3.75 |
| 1.585999999999936 | 1.75 | 3.5 | 3.75 |
| 1.586999999999936 | 1.75 | 3.5 | 3.75 |
| 1.587999999999936 | 1.75 | 3.5 | 3.75 |
| 1.588999999999936 | 1.75 | 3.5 | 3.75 |
| 1.589999999999936 | 1.75 | 3.5 | 3.75 |
| 1.590999999999936 | 1.75 | 3.5 | 3.75 |
| 1.591999999999935 | 1.75 | 3.5 | 3.75 |
| 1.592999999999935 | 1.75 | 3.5 | 3.75 |
| 1.593999999999935 | 1.75 | 3.5 | 3.75 |
| 1.594999999999935 | 1.75 | 3.5 | 3.75 |
| 1.595999999999935 | 1.75 | 3.5 | 3.75 |
| 1.596999999999935 | 1.75 | 3.5 | 3.75 |
| 1.597999999999935 | 1.75 | 3.5 | 3.75 |
| 1.598999999999935 | 1.75 | 3.5 | 3.75 |
| 1.599999999999935 | 1.75 | 3.5 | 3.75 |
| 1.600999999999934 | 1.75 | 3.5 | 3.75 |
| 1.601999999999934 | 1.75 | 3.5 | 3.75 |
| 1.602999999999934 | 1.75 | 3.5 | 3.75 |
| 1.603999999999934 | 1.75 | 3.5 | 3.75 |
| 1.604999999999934 | 1.75 | 3.5 | 3.75 |
| 1.605999999999934 | 1.75 | 3.5 | 3.75 |
| 1.606999999999934 | 1.75 | 3.5 | 3.75 |
| 1.607999999999934 | 1.75 | 3.5 | 3.75 |
| 1.608999999999934 | 1.75 | 3.5 | 3.75 |
| 1.609999999999933 | 1.75 | 3.5 | 3.75 |
| 1.610999999999933 | 1.75 | 3.5 | 3.75 |
| 1.611999999999933 | 1.75 | 3.5 | 3.75 |
| 1.612999999999933 | 1.75 | 3.5 | 3.75 |
| 1.613999999999933 | 1.75 | 3.5 | 3.75 |
| 1.614999999999933 | 1.75 | 3.5 | 3.75 |
| 1.615999999999933 | 1.75 | 3.5 | 3.75 |
| 1.616999999999933 | 1.75 | 3.5 | 3.75 |
| 1.617999999999933 | 1.75 | 3.5 | 3.75 |
| 1.618999999999932 | 1.75 | 3.5 | 3.75 |
| 1.619999999999932 | 1.75 | 3.5 | 3.75 |
| 1.620999999999932 | 1.75 | 3.5 | 3.75 |
| 1.621999999999932 | 1.75 | 3.5 | 3.75 |
| 1.622999999999932 | 1.75 | 3.5 | 3.75 |
| 1.623999999999932 | 1.75 | 3.5 | 3.75 |
| 1.624999999999932 | 1.75 | 3.5 | 3.75 |
| 1.625999999999932 | 1.75 | 3.5 | 3.75 |
| 1.626999999999932 | 1.75 | 3.5 | 3.75 |
| 1.627999999999931 | 1.75 | 3.5 | 3.75 |
| 1.628999999999931 | 1.75 | 3.5 | 3.75 |
| 1.629999999999931 | 1.75 | 3.5 | 3.75 |
| 1.630999999999931 | 1.75 | 3.5 | 3.75 |
| 1.631999999999931 | 1.75 | 3.5 | 3.75 |
| 1.632999999999931 | 1.75 | 3.5 | 3.75 |
| 1.633999999999931 | 1.75 | 3.5 | 3.75 |
| 1.634999999999931 | 1.75 | 3.5 | 3.75 |
| 1.635999999999931 | 1.75 | 3.5 | 3.75 |
| 1.63699999999993 | 1.75 | 3.5 | 3.75 |
| 1.63799999999993 | 1.75 | 3.5 | 3.75 |
| 1.63899999999993 | 1.75 | 3.5 | 3.75 |
| 1.63999999999993 | 1.75 | 3.5 | 3.75 |
| 1.64099999999993 | 1.75 | 3.5 | 3.75 |
| 1.64199999999993 | 1.75 | 3.5 | 3.75 |
| 1.64299999999993 | 1.75 | 3.5 | 3.75 |
| 1.64399999999993 | 1.75 | 3.5 | 3.75 |
| 1.64499999999993 | 1.75 | 3.5 | 3.75 |
| 1.645999999999929 | 1.75 | 3.5 | 3.75 |
| 1.646999999999929 | 1.75 | 3.5 | 3.75 |
| 1.647999999999929 | 1.75 | 3.5 | 3.75 |
| 1.648999999999929 | 1.75 | 3.5 | 3.75 |
| 1.649999999999929 | 1.75 | 3.5 | 3.75 |
| 1.650999999999929 | 1.75 | 3.5 | 3.75 |
| 1.651999999999929 | 1.75 | 3.5 | 3.75 |
| 1.652999999999929 | 1.75 | 3.5 | 3.75 |
| 1.653999999999929 | 1.75 | 3.5 | 3.75 |
| 1.654999999999928 | 1.75 | 3.5 | 3.75 |
| 1.655999999999928 | 1.75 | 3.5 | 3.75 |
| 1.656999999999928 | 1.75 | 3.5 | 3.75 |
| 1.657999999999928 | 1.75 | 3.5 | 3.75 |
| 1.658999999999928 | 1.75 | 3.5 | 3.75 |
| 1.659999999999928 | 1.75 | 3.5 | 3.75 |
| 1.660999999999928 | 1.75 | 3.5 | 3.75 |
| 1.661999999999928 | 1.75 | 3.5 | 3.75 |
| 1.662999999999928 | 1.75 | 3.5 | 3.75 |
| 1.663999999999927 | 1.75 | 3.5 | 3.75 |
| 1.664999999999927 | 1.75 | 3.5 | 3.75 |
| 1.665999999999927 | 1.75 | 3.5 | 3.75 |
| 1.666999999999927 | 1.75 | 3.5 | 3.75 |
| 1.667999999999927 | 1.75 | 3.5 | 3.75 |
| 1.668999999999927 | 1.75 | 3.5 | 3.75 |
| 1.669999999999927 | 1.75 | 3.5 | 3.75 |
| 1.670999999999927 | 1.75 | 3.5 | 3.75 |
| 1.671999999999927 | 1.75 | 3.5 | 3.75 |
| 1.672999999999926 | 1.75 | 3.5 | 3.75 |
| 1.673999999999926 | 1.75 | 3.5 | 3.75 |
| 1.674999999999926 | 1.75 | 3.5 | 3.75 |
| 1.675999999999926 | 1.75 | 3.5 | 3.75 |
| 1.676999999999926 | 1.75 | 3.5 | 3.75 |
| 1.677999999999926 | 1.75 | 3.5 | 3.75 |
| 1.678999999999926 | 1.75 | 3.5 | 3.75 |
| 1.679999999999926 | 1.75 | 3.5 | 3.75 |
| 1.680999999999926 | 1.75 | 3.5 | 3.75 |
| 1.681999999999925 | 1.75 | 3.5 | 3.75 |
| 1.682999999999925 | 1.75 | 3.5 | 3.75 |
| 1.683999999999925 | 1.75 | 3.5 | 3.75 |
| 1.684999999999925 | 1.75 | 3.5 | 3.75 |
| 1.685999999999925 | 1.75 | 3.5 | 3.75 |
| 1.686999999999925 | 1.75 | 3.5 | 3.75 |
| 1.687999999999925 | 1.75 | 3.5 | 3.75 |
| 1.688999999999925 | 1.75 | 3.5 | 3.75 |
| 1.689999999999925 | 1.75 | 3.5 | 3.75 |
| 1.690999999999924 | 1.75 | 3.5 | 3.75 |
| 1.691999999999924 | 1.75 | 3.5 | 3.75 |
| 1.692999999999924 | 1.75 | 3.5 | 3.75 |
| 1.693999999999924 | 1.75 | 3.5 | 3.75 |
| 1.694999999999924 | 1.75 | 3.5 | 3.75 |
| 1.695999999999924 | 1.75 | 3.5 | 3.75 |
| 1.696999999999924 | 1.75 | 3.5 | 3.75 |
| 1.697999999999924 | 1.75 | 3.5 | 3.75 |
| 1.698999999999924 | 1.75 | 3.5 | 3.75 |
| 1.699999999999923 | 1.75 | 3.5 | 3.75 |
| 1.700999999999923 | 1.75 | 3.5 | 3.75 |
| 1.701999999999923 | 1.75 | 3.5 | 3.75 |
| 1.702999999999923 | 1.75 | 3.5 | 3.75 |
| 1.703999999999923 | 1.75 | 3.5 | 3.75 |
| 1.704999999999923 | 1.75 | 3.5 | 3.75 |
| 1.705999999999923 | 1.75 | 3.5 | 3.75 |
| 1.706999999999923 | 1.75 | 3.5 | 3.75 |
| 1.707999999999923 | 1.75 | 3.5 | 3.75 |
| 1.708999999999923 | 1.75 | 3.5 | 3.75 |
| 1.709999999999922 | 1.75 | 3.5 | 3.75 |
| 1.710999999999922 | 1.75 | 3.5 | 3.75 |
| 1.711999999999922 | 1.75 | 3.5 | 3.75 |
| 1.712999999999922 | 1.75 | 3.5 | 3.75 |
| 1.713999999999922 | 1.75 | 3.5 | 3.75 |
| 1.714999999999922 | 1.75 | 3.5 | 3.75 |
| 1.715999999999922 | 1.75 | 3.5 | 3.75 |
| 1.716999999999922 | 1.75 | 3.5 | 3.75 |
| 1.717999999999922 | 1.75 | 3.5 | 3.75 |
| 1.718999999999921 | 1.75 | 3.5 | 3.75 |
| 1.719999999999921 | 1.75 | 3.5 | 3.75 |
| 1.720999999999921 | 1.75 | 3.5 | 3.75 |
| 1.721999999999921 | 1.75 | 3.5 | 3.75 |
| 1.722999999999921 | 1.75 | 3.5 | 3.75 |
| 1.723999999999921 | 1.75 | 3.5 | 3.75 |
| 1.724999999999921 | 1.75 | 3.5 | 3.75 |
| 1.725999999999921 | 1.75 | 3.5 | 3.75 |
| 1.726999999999921 | 1.75 | 3.5 | 3.75 |
| 1.72799999999992 | 1.75 | 3.5 | 3.75 |
| 1.72899999999992 | 1.75 | 3.5 | 3.75 |
| 1.72999999999992 | 1.75 | 3.5 | 3.75 |
| 1.73099999999992 | 1.75 | 3.5 | 3.75 |
| 1.73199999999992 | 1.75 | 3.5 | 3.75 |
| 1.73299999999992 | 1.75 | 3.5 | 3.75 |
| 1.73399999999992 | 1.75 | 3.5 | 3.75 |
| 1.73499999999992 | 1.75 | 3.5 | 3.75 |
| 1.73599999999992 | 1.75 | 3.5 | 3.75 |
| 1.736999999999919 | 1.75 | 3.5 | 3.75 |
| 1.737999999999919 | 1.75 | 3.5 | 3.75 |
| 1.738999999999919 | 1.75 | 3.5 | 3.75 |
| 1.739999999999919 | 1.75 | 3.5 | 3.75 |
| 1.740999999999919 | 1.75 | 3.5 | 3.75 |
| 1.741999999999919 | 1.75 | 3.5 | 3.75 |
| 1.742999999999919 | 1.75 | 3.5 | 3.75 |
| 1.743999999999919 | 1.75 | 3.5 | 3.75 |
| 1.744999999999919 | 1.75 | 3.5 | 3.75 |
| 1.745999999999918 | 1.75 | 3.5 | 3.75 |
| 1.746999999999918 | 1.75 | 3.5 | 3.75 |
| 1.747999999999918 | 1.75 | 3.5 | 3.75 |
| 1.748999999999918 | 1.75 | 3.5 | 3.75 |
| 1.749999999999918 | 1.75 | 3.5 | 3.75 |
| 1.750999999999918 | 1.75 | 3.5 | 3.75 |
| 1.751999999999918 | 1.75 | 3.5 | 3.75 |
| 1.752999999999918 | 1.75 | 3.5 | 3.75 |
| 1.753999999999918 | 1.75 | 3.5 | 3.75 |
| 1.754999999999917 | 1.75 | 3.5 | 3.75 |
| 1.755999999999917 | 1.75 | 3.5 | 3.75 |
| 1.756999999999917 | 1.75 | 3.5 | 3.75 |
| 1.757999999999917 | 1.75 | 3.5 | 3.75 |
| 1.758999999999917 | 1.75 | 3.5 | 3.75 |
| 1.759999999999917 | 1.75 | 3.5 | 3.75 |
| 1.760999999999917 | 1.75 | 3.5 | 3.75 |
| 1.761999999999917 | 1.75 | 3.5 | 3.75 |
| 1.762999999999917 | 1.75 | 3.5 | 3.75 |
| 1.763999999999916 | 1.75 | 3.5 | 3.75 |
| 1.764999999999916 | 1.75 | 3.5 | 3.75 |
| 1.765999999999916 | 1.75 | 3.5 | 3.75 |
| 1.766999999999916 | 1.75 | 3.5 | 3.75 |
| 1.767999999999916 | 1.75 | 3.5 | 3.75 |
| 1.768999999999916 | 1.75 | 3.5 | 3.75 |
| 1.769999999999916 | 1.75 | 3.5 | 3.75 |
| 1.770999999999916 | 1.75 | 3.5 | 3.75 |
| 1.771999999999916 | 1.75 | 3.5 | 3.75 |
| 1.772999999999915 | 1.75 | 3.5 | 3.75 |
| 1.773999999999915 | 1.75 | 3.5 | 3.75 |
| 1.774999999999915 | 1.75 | 3.5 | 3.75 |
| 1.775999999999915 | 1.75 | 3.5 | 3.75 |
| 1.776999999999915 | 1.75 | 3.5 | 3.75 |
| 1.777999999999915 | 1.75 | 3.5 | 3.75 |
| 1.778999999999915 | 1.75 | 3.5 | 3.75 |
| 1.779999999999915 | 1.75 | 3.5 | 3.75 |
| 1.780999999999915 | 1.75 | 3.5 | 3.75 |
| 1.781999999999914 | 1.75 | 3.5 | 3.75 |
| 1.782999999999914 | 1.75 | 3.5 | 3.75 |
| 1.783999999999914 | 1.75 | 3.5 | 3.75 |
| 1.784999999999914 | 1.75 | 3.5 | 3.75 |
| 1.785999999999914 | 1.75 | 3.5 | 3.75 |
| 1.786999999999914 | 1.75 | 3.5 | 3.75 |
| 1.787999999999914 | 1.75 | 3.5 | 3.75 |
| 1.788999999999914 | 1.75 | 3.5 | 3.75 |
| 1.789999999999914 | 1.75 | 3.5 | 3.75 |
| 1.790999999999913 | 1.75 | 3.5 | 3.75 |
| 1.791999999999913 | 1.75 | 3.5 | 3.75 |
| 1.792999999999913 | 1.75 | 3.5 | 3.75 |
| 1.793999999999913 | 1.75 | 3.5 | 3.75 |
| 1.794999999999913 | 1.75 | 3.5 | 3.75 |
| 1.795999999999913 | 1.75 | 3.5 | 3.75 |
| 1.796999999999913 | 1.75 | 3.5 | 3.75 |
| 1.797999999999913 | 1.75 | 3.5 | 3.75 |
| 1.798999999999913 | 1.75 | 3.5 | 3.75 |
| 1.799999999999912 | 1.75 | 3.5 | 3.75 |
| 1.800999999999912 | 1.75 | 3.5 | 3.75 |
| 1.801999999999912 | 1.75 | 3.5 | 3.75 |
| 1.802999999999912 | 1.75 | 3.5 | 3.75 |
| 1.803999999999912 | 1.75 | 3.5 | 3.75 |
| 1.804999999999912 | 1.75 | 3.5 | 3.75 |
| 1.805999999999912 | 1.75 | 3.5 | 3.75 |
| 1.806999999999912 | 1.75 | 3.5 | 3.75 |
| 1.807999999999912 | 1.75 | 3.5 | 3.75 |
| 1.808999999999912 | 1.75 | 3.5 | 3.75 |
| 1.809999999999911 | 1.75 | 3.5 | 3.75 |
| 1.810999999999911 | 1.75 | 3.5 | 3.75 |
| 1.811999999999911 | 1.75 | 3.5 | 3.75 |
| 1.812999999999911 | 1.75 | 3.5 | 3.75 |
| 1.813999999999911 | 1.75 | 3.5 | 3.75 |
| 1.814999999999911 | 1.75 | 3.5 | 3.75 |
| 1.815999999999911 | 1.75 | 3.5 | 3.75 |
| 1.816999999999911 | 1.75 | 3.5 | 3.75 |
| 1.817999999999911 | 1.75 | 3.5 | 3.75 |
| 1.81899999999991 | 1.75 | 3.5 | 3.75 |
| 1.81999999999991 | 1.75 | 3.5 | 3.75 |
| 1.82099999999991 | 1.75 | 3.5 | 3.75 |
| 1.82199999999991 | 1.75 | 3.5 | 3.75 |
| 1.82299999999991 | 1.75 | 3.5 | 3.75 |
| 1.82399999999991 | 1.75 | 3.5 | 3.75 |
| 1.82499999999991 | 1.75 | 3.5 | 3.75 |
| 1.82599999999991 | 1.75 | 3.5 | 3.75 |
| 1.82699999999991 | 1.75 | 3.5 | 3.75 |
| 1.827999999999909 | 1.75 | 3.5 | 3.75 |
| 1.828999999999909 | 1.75 | 3.5 | 3.75 |
| 1.829999999999909 | 1.75 | 3.5 | 3.75 |
| 1.830999999999909 | 1.75 | 3.5 | 3.75 |
| 1.831999999999909 | 1.75 | 3.5 | 3.75 |
| 1.832999999999909 | 1.75 | 3.5 | 3.75 |
| 1.833999999999909 | 1.75 | 3.5 | 3.75 |
| 1.834999999999909 | 1.75 | 3.5 | 3.75 |
| 1.835999999999909 | 1.75 | 3.5 | 3.75 |
| 1.836999999999908 | 1.75 | 3.5 | 3.75 |
| 1.837999999999908 | 1.75 | 3.5 | 3.75 |
| 1.838999999999908 | 1.75 | 3.5 | 3.75 |
| 1.839999999999908 | 1.75 | 3.5 | 3.75 |
| 1.840999999999908 | 1.75 | 3.5 | 3.75 |
| 1.841999999999908 | 1.75 | 3.5 | 3.75 |
| 1.842999999999908 | 1.75 | 3.5 | 3.75 |
| 1.843999999999908 | 1.75 | 3.5 | 3.75 |
| 1.844999999999908 | 1.75 | 3.5 | 3.75 |
| 1.845999999999907 | 1.75 | 3.5 | 3.75 |
| 1.846999999999907 | 1.75 | 3.5 | 3.75 |
| 1.847999999999907 | 1.75 | 3.5 | 3.75 |
| 1.848999999999907 | 1.75 | 3.5 | 3.75 |
| 1.849999999999907 | 1.75 | 3.5 | 3.75 |
| 1.850999999999907 | 1.75 | 3.5 | 3.75 |
| 1.851999999999907 | 1.75 | 3.5 | 3.75 |
| 1.852999999999907 | 1.75 | 3.5 | 3.75 |
| 1.853999999999907 | 1.75 | 3.5 | 3.75 |
| 1.854999999999906 | 1.75 | 3.5 | 3.75 |
| 1.855999999999906 | 1.75 | 3.5 | 3.75 |
| 1.856999999999906 | 1.75 | 3.5 | 3.75 |
| 1.857999999999906 | 1.75 | 3.5 | 3.75 |
| 1.858999999999906 | 1.75 | 3.5 | 3.75 |
| 1.859999999999906 | 1.75 | 3.5 | 3.75 |
| 1.860999999999906 | 1.75 | 3.5 | 3.75 |
| 1.861999999999906 | 1.75 | 3.5 | 3.75 |
| 1.862999999999906 | 1.75 | 3.5 | 3.75 |
| 1.863999999999905 | 1.75 | 3.5 | 3.75 |
| 1.864999999999905 | 1.75 | 3.5 | 3.75 |
| 1.865999999999905 | 1.75 | 3.5 | 3.75 |
| 1.866999999999905 | 1.75 | 3.5 | 3.75 |
| 1.867999999999905 | 1.75 | 3.5 | 3.75 |
| 1.868999999999905 | 1.75 | 3.5 | 3.75 |
| 1.869999999999905 | 1.75 | 3.5 | 3.75 |
| 1.870999999999905 | 1.75 | 3.5 | 3.75 |
| 1.871999999999905 | 1.75 | 3.5 | 3.75 |
| 1.872999999999904 | 1.75 | 3.5 | 3.75 |
| 1.873999999999904 | 1.75 | 3.5 | 3.75 |
| 1.874999999999904 | 1.75 | 3.5 | 3.75 |
| 1.875999999999904 | 1.75 | 3.5 | 3.75 |
| 1.876999999999904 | 1.75 | 3.5 | 3.75 |
| 1.877999999999904 | 1.75 | 3.5 | 3.75 |
| 1.878999999999904 | 1.75 | 3.5 | 3.75 |
| 1.879999999999904 | 1.75 | 3.5 | 3.75 |
| 1.880999999999904 | 1.75 | 3.5 | 3.75 |
| 1.881999999999903 | 1.75 | 3.5 | 3.75 |
| 1.882999999999903 | 1.75 | 3.5 | 3.75 |
| 1.883999999999903 | 1.75 | 3.5 | 3.75 |
| 1.884999999999903 | 1.75 | 3.5 | 3.75 |
| 1.885999999999903 | 1.75 | 3.5 | 3.75 |
| 1.886999999999903 | 1.75 | 3.5 | 3.75 |
| 1.887999999999903 | 1.75 | 3.5 | 3.75 |
| 1.888999999999903 | 1.75 | 3.5 | 3.75 |
| 1.889999999999903 | 1.75 | 3.5 | 3.75 |
| 1.890999999999902 | 1.75 | 3.5 | 3.75 |
| 1.891999999999902 | 1.75 | 3.5 | 3.75 |
| 1.892999999999902 | 1.75 | 3.5 | 3.75 |
| 1.893999999999902 | 1.75 | 3.5 | 3.75 |
| 1.894999999999902 | 1.75 | 3.5 | 3.75 |
| 1.895999999999902 | 1.75 | 3.5 | 3.75 |
| 1.896999999999902 | 1.75 | 3.5 | 3.75 |
| 1.897999999999902 | 1.75 | 3.5 | 3.75 |
| 1.898999999999902 | 1.75 | 3.5 | 3.75 |
| 1.899999999999901 | 1.75 | 3.5 | 3.75 |
| 1.900999999999901 | 1.75 | 3.5 | 3.75 |
| 1.901999999999901 | 1.75 | 3.5 | 3.75 |
| 1.902999999999901 | 1.75 | 3.5 | 3.75 |
| 1.903999999999901 | 1.75 | 3.5 | 3.75 |
| 1.904999999999901 | 1.75 | 3.5 | 3.75 |
| 1.905999999999901 | 1.75 | 3.5 | 3.75 |
| 1.906999999999901 | 1.75 | 3.5 | 3.75 |
| 1.907999999999901 | 1.75 | 3.5 | 3.75 |
| 1.908999999999901 | 1.75 | 3.5 | 3.75 |
| 1.9099999999999 | 1.75 | 3.5 | 3.75 |
| 1.9109999999999 | 1.75 | 3.5 | 3.75 |
| 1.9119999999999 | 1.75 | 3.5 | 3.75 |
| 1.9129999999999 | 1.75 | 3.5 | 3.75 |
| 1.9139999999999 | 1.75 | 3.5 | 3.75 |
| 1.9149999999999 | 1.75 | 3.5 | 3.75 |
| 1.9159999999999 | 1.75 | 3.5 | 3.75 |
| 1.9169999999999 | 1.75 | 3.5 | 3.75 |
| 1.9179999999999 | 1.75 | 3.5 | 3.75 |
| 1.918999999999899 | 1.75 | 3.5 | 3.75 |
| 1.919999999999899 | 1.75 | 3.5 | 3.75 |
| 1.920999999999899 | 1.75 | 3.5 | 3.75 |
| 1.921999999999899 | 1.75 | 3.5 | 3.75 |
| 1.922999999999899 | 1.75 | 3.5 | 3.75 |
| 1.923999999999899 | 1.75 | 3.5 | 3.75 |
| 1.924999999999899 | 1.75 | 3.5 | 3.75 |
| 1.925999999999899 | 1.75 | 3.5 | 3.75 |
| 1.926999999999899 | 1.75 | 3.5 | 3.75 |
| 1.927999999999898 | 1.75 | 3.5 | 3.75 |
| 1.928999999999898 | 1.75 | 3.5 | 3.75 |
| 1.929999999999898 | 1.75 | 3.5 | 3.75 |
| 1.930999999999898 | 1.75 | 3.5 | 3.75 |
| 1.931999999999898 | 1.75 | 3.5 | 3.75 |
| 1.932999999999898 | 1.75 | 3.5 | 3.75 |
| 1.933999999999898 | 1.75 | 3.5 | 3.75 |
| 1.934999999999898 | 1.75 | 3.5 | 3.75 |
| 1.935999999999898 | 1.75 | 3.5 | 3.75 |
| 1.936999999999897 | 1.75 | 3.5 | 3.75 |
| 1.937999999999897 | 1.75 | 3.5 | 3.75 |
| 1.938999999999897 | 1.75 | 3.5 | 3.75 |
| 1.939999999999897 | 1.75 | 3.5 | 3.75 |
| 1.940999999999897 | 1.75 | 3.5 | 3.75 |
| 1.941999999999897 | 1.75 | 3.5 | 3.75 |
| 1.942999999999897 | 1.75 | 3.5 | 3.75 |
| 1.943999999999897 | 1.75 | 3.5 | 3.75 |
| 1.944999999999897 | 1.75 | 3.5 | 3.75 |
| 1.945999999999896 | 1.75 | 3.5 | 3.75 |
| 1.946999999999896 | 1.75 | 3.5 | 3.75 |
| 1.947999999999896 | 1.75 | 3.5 | 3.75 |
| 1.948999999999896 | 1.75 | 3.5 | 3.75 |
| 1.949999999999896 | 1.75 | 3.5 | 3.75 |
| 1.950999999999896 | 1.75 | 3.5 | 3.75 |
| 1.951999999999896 | 1.75 | 3.5 | 3.75 |
| 1.952999999999896 | 1.75 | 3.5 | 3.75 |
| 1.953999999999896 | 1.75 | 3.5 | 3.75 |
| 1.954999999999895 | 1.75 | 3.5 | 3.75 |
| 1.955999999999895 | 1.75 | 3.5 | 3.75 |
| 1.956999999999895 | 1.75 | 3.5 | 3.75 |
| 1.957999999999895 | 1.75 | 3.5 | 3.75 |
| 1.958999999999895 | 1.75 | 3.5 | 3.75 |
| 1.959999999999895 | 1.75 | 3.5 | 3.75 |
| 1.960999999999895 | 1.75 | 3.5 | 3.75 |
| 1.961999999999895 | 1.75 | 3.5 | 3.75 |
| 1.962999999999895 | 1.75 | 3.5 | 3.75 |
| 1.963999999999894 | 1.75 | 3.5 | 3.75 |
| 1.964999999999894 | 1.75 | 3.5 | 3.75 |
| 1.965999999999894 | 1.75 | 3.5 | 3.75 |
| 1.966999999999894 | 1.75 | 3.5 | 3.75 |
| 1.967999999999894 | 1.75 | 3.5 | 3.75 |
| 1.968999999999894 | 1.75 | 3.5 | 3.75 |
| 1.969999999999894 | 1.75 | 3.5 | 3.75 |
| 1.970999999999894 | 1.75 | 3.5 | 3.75 |
| 1.971999999999894 | 1.75 | 3.5 | 3.75 |
| 1.972999999999893 | 1.75 | 3.5 | 3.75 |
| 1.973999999999893 | 1.75 | 3.5 | 3.75 |
| 1.974999999999893 | 1.75 | 3.5 | 3.75 |
| 1.975999999999893 | 1.75 | 3.5 | 3.75 |
| 1.976999999999893 | 1.75 | 3.5 | 3.75 |
| 1.977999999999893 | 1.75 | 3.5 | 3.75 |
| 1.978999999999893 | 1.75 | 3.5 | 3.75 |
| 1.979999999999893 | 1.75 | 3.5 | 3.75 |
| 1.980999999999893 | 1.75 | 3.5 | 3.75 |
| 1.981999999999892 | 1.75 | 3.5 | 3.75 |
| 1.982999999999892 | 1.75 | 3.5 | 3.75 |
| 1.983999999999892 | 1.75 | 3.5 | 3.75 |
| 1.984999999999892 | 1.75 | 3.5 | 3.75 |
| 1.985999999999892 | 1.75 | 3.5 | 3.75 |
| 1.986999999999892 | 1.75 | 3.5 | 3.75 |
| 1.987999999999892 | 1.75 | 3.5 | 3.75 |
| 1.988999999999892 | 1.75 | 3.5 | 3.75 |
| 1.989999999999892 | 1.75 | 3.5 | 3.75 |
| 1.990999999999891 | 1.75 | 3.5 | 3.75 |
| 1.991999999999891 | 1.75 | 3.5 | 3.75 |
| 1.992999999999891 | 1.75 | 3.5 | 3.75 |
| 1.993999999999891 | 1.75 | 3.5 | 3.75 |
| 1.994999999999891 | 1.75 | 3.5 | 3.75 |
| 1.995999999999891 | 1.75 | 3.5 | 3.75 |
| 1.996999999999891 | 1.75 | 3.5 | 3.75 |
| 1.997999999999891 | 1.75 | 3.5 | 3.75 |
| 1.998999999999891 | 1.75 | 3.5 | 3.75 |
| 1.99999999999989 | 1.75 | 3.5 | 3.75 |